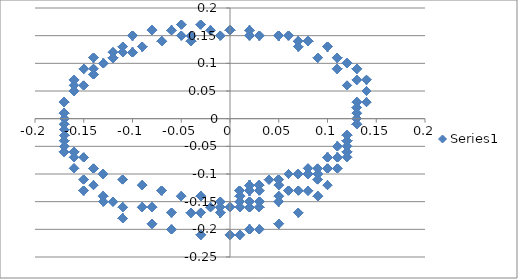
| Category | Series 0 |
|---|---|
| 0.03 | -0.15 |
| 0.03 | -0.15 |
| 0.03 | -0.15 |
| 0.03 | -0.15 |
| 0.03 | -0.15 |
| 0.03 | -0.15 |
| 0.03 | -0.15 |
| 0.03 | -0.15 |
| 0.03 | -0.15 |
| 0.03 | -0.15 |
| 0.03 | -0.15 |
| 0.03 | -0.15 |
| 0.03 | -0.15 |
| 0.03 | -0.15 |
| 0.03 | -0.15 |
| 0.03 | -0.15 |
| 0.03 | -0.15 |
| 0.03 | -0.15 |
| 0.03 | -0.15 |
| 0.03 | -0.15 |
| 0.03 | -0.15 |
| 0.03 | -0.15 |
| 0.03 | -0.15 |
| 0.03 | -0.15 |
| 0.03 | -0.15 |
| 0.03 | -0.15 |
| 0.03 | -0.15 |
| 0.03 | -0.15 |
| 0.03 | -0.15 |
| 0.03 | -0.15 |
| 0.03 | -0.15 |
| 0.03 | -0.15 |
| 0.03 | -0.15 |
| 0.03 | -0.15 |
| 0.03 | -0.15 |
| 0.03 | -0.15 |
| 0.03 | -0.15 |
| 0.03 | -0.15 |
| 0.03 | -0.15 |
| 0.03 | -0.15 |
| 0.03 | -0.15 |
| 0.03 | -0.15 |
| 0.03 | -0.15 |
| 0.03 | -0.15 |
| 0.03 | -0.15 |
| 0.03 | -0.15 |
| 0.03 | -0.15 |
| 0.03 | -0.15 |
| 0.03 | -0.15 |
| 0.03 | -0.15 |
| 0.03 | -0.15 |
| 0.03 | -0.15 |
| 0.03 | -0.15 |
| 0.03 | -0.15 |
| 0.03 | -0.15 |
| 0.03 | -0.15 |
| 0.03 | -0.15 |
| 0.03 | -0.15 |
| 0.03 | -0.15 |
| 0.03 | -0.15 |
| 0.03 | -0.15 |
| 0.03 | -0.15 |
| 0.03 | -0.15 |
| 0.03 | -0.15 |
| 0.03 | -0.15 |
| 0.03 | -0.15 |
| 0.03 | -0.15 |
| 0.03 | -0.15 |
| 0.03 | -0.15 |
| 0.03 | -0.15 |
| 0.03 | -0.15 |
| 0.03 | -0.15 |
| 0.03 | -0.15 |
| 0.03 | -0.15 |
| 0.03 | -0.15 |
| 0.03 | -0.15 |
| 0.03 | -0.15 |
| 0.03 | -0.15 |
| 0.03 | -0.15 |
| 0.03 | -0.15 |
| 0.03 | -0.15 |
| 0.03 | -0.15 |
| 0.03 | -0.15 |
| 0.03 | -0.15 |
| 0.03 | -0.15 |
| 0.03 | -0.15 |
| 0.03 | -0.15 |
| 0.03 | -0.15 |
| 0.03 | -0.15 |
| 0.03 | -0.15 |
| 0.03 | -0.15 |
| 0.03 | -0.15 |
| 0.03 | -0.15 |
| 0.03 | -0.15 |
| 0.03 | -0.15 |
| 0.03 | -0.15 |
| 0.03 | -0.15 |
| 0.03 | -0.15 |
| 0.03 | -0.15 |
| 0.03 | -0.15 |
| 0.03 | -0.15 |
| 0.03 | -0.15 |
| 0.03 | -0.15 |
| 0.03 | -0.15 |
| 0.03 | -0.15 |
| 0.03 | -0.15 |
| 0.03 | -0.15 |
| 0.03 | -0.15 |
| 0.03 | -0.15 |
| 0.03 | -0.15 |
| 0.03 | -0.15 |
| 0.03 | -0.15 |
| 0.03 | -0.15 |
| 0.03 | -0.15 |
| 0.03 | -0.15 |
| 0.03 | -0.15 |
| 0.03 | -0.15 |
| 0.03 | -0.15 |
| 0.03 | -0.15 |
| 0.03 | -0.15 |
| 0.03 | -0.15 |
| 0.03 | -0.15 |
| 0.03 | -0.15 |
| 0.03 | -0.15 |
| 0.03 | -0.15 |
| 0.03 | -0.15 |
| 0.03 | -0.15 |
| 0.03 | -0.15 |
| 0.03 | -0.15 |
| 0.03 | -0.15 |
| 0.03 | -0.15 |
| 0.03 | -0.15 |
| 0.03 | -0.15 |
| 0.03 | -0.15 |
| 0.03 | -0.15 |
| 0.03 | -0.15 |
| 0.03 | -0.15 |
| 0.03 | -0.15 |
| 0.03 | -0.15 |
| 0.03 | -0.15 |
| 0.03 | -0.15 |
| 0.03 | -0.15 |
| 0.03 | -0.15 |
| 0.03 | -0.15 |
| 0.03 | -0.15 |
| 0.03 | -0.15 |
| 0.03 | -0.15 |
| 0.03 | -0.15 |
| 0.03 | -0.15 |
| 0.03 | -0.15 |
| 0.03 | -0.15 |
| 0.03 | -0.15 |
| 0.03 | -0.15 |
| 0.03 | -0.15 |
| 0.03 | -0.15 |
| 0.03 | -0.15 |
| 0.03 | -0.15 |
| 0.03 | -0.15 |
| 0.03 | -0.15 |
| 0.03 | -0.15 |
| 0.03 | -0.15 |
| 0.03 | -0.15 |
| 0.03 | -0.15 |
| 0.03 | -0.15 |
| 0.03 | -0.15 |
| 0.03 | -0.15 |
| 0.03 | -0.15 |
| 0.03 | -0.15 |
| 0.03 | -0.15 |
| 0.03 | -0.15 |
| 0.03 | -0.15 |
| 0.03 | -0.15 |
| 0.03 | -0.15 |
| 0.03 | -0.15 |
| 0.03 | -0.15 |
| 0.03 | -0.15 |
| 0.03 | -0.15 |
| 0.03 | -0.15 |
| 0.03 | -0.15 |
| 0.03 | -0.15 |
| 0.03 | -0.15 |
| 0.03 | -0.15 |
| 0.03 | -0.15 |
| 0.03 | -0.15 |
| 0.03 | -0.15 |
| 0.03 | -0.15 |
| 0.03 | -0.15 |
| 0.03 | -0.15 |
| 0.03 | -0.15 |
| 0.03 | -0.15 |
| 0.03 | -0.15 |
| 0.03 | -0.15 |
| 0.03 | -0.15 |
| 0.03 | -0.15 |
| 0.03 | -0.15 |
| 0.03 | -0.15 |
| 0.03 | -0.15 |
| 0.03 | -0.15 |
| 0.03 | -0.15 |
| 0.03 | -0.15 |
| 0.03 | -0.15 |
| 0.03 | -0.15 |
| 0.03 | -0.15 |
| 0.03 | -0.15 |
| 0.03 | -0.15 |
| 0.03 | -0.15 |
| 0.03 | -0.15 |
| 0.03 | -0.15 |
| 0.03 | -0.15 |
| 0.03 | -0.15 |
| 0.03 | -0.15 |
| 0.03 | -0.15 |
| 0.03 | -0.15 |
| 0.03 | -0.15 |
| 0.03 | -0.15 |
| 0.03 | -0.15 |
| 0.03 | -0.16 |
| 0.03 | -0.16 |
| 0.03 | -0.16 |
| 0.03 | -0.16 |
| 0.03 | -0.16 |
| 0.03 | -0.16 |
| 0.03 | -0.15 |
| 0.03 | -0.15 |
| 0.03 | -0.15 |
| 0.03 | -0.15 |
| 0.03 | -0.15 |
| 0.03 | -0.15 |
| 0.03 | -0.15 |
| 0.03 | -0.15 |
| 0.03 | -0.15 |
| 0.03 | -0.15 |
| 0.03 | -0.15 |
| 0.03 | -0.15 |
| 0.03 | -0.16 |
| 0.03 | -0.16 |
| 0.03 | -0.16 |
| 0.03 | -0.16 |
| 0.03 | -0.16 |
| 0.03 | -0.16 |
| 0.02 | -0.2 |
| 0.02 | -0.2 |
| 0.02 | -0.2 |
| 0.02 | -0.2 |
| 0.02 | -0.2 |
| 0.02 | -0.2 |
| 0.01 | -0.21 |
| 0.01 | -0.21 |
| 0.01 | -0.21 |
| 0.01 | -0.21 |
| 0.01 | -0.21 |
| 0.01 | -0.21 |
| 0.01 | -0.21 |
| 0.01 | -0.21 |
| 0.01 | -0.21 |
| 0.01 | -0.21 |
| 0.01 | -0.21 |
| 0.01 | -0.21 |
| 0.02 | -0.2 |
| 0.02 | -0.2 |
| 0.02 | -0.2 |
| 0.02 | -0.2 |
| 0.02 | -0.2 |
| 0.02 | -0.2 |
| 0.02 | -0.15 |
| 0.02 | -0.15 |
| 0.02 | -0.15 |
| 0.02 | -0.15 |
| 0.02 | -0.15 |
| 0.02 | -0.15 |
| 0.02 | -0.15 |
| 0.02 | -0.15 |
| 0.02 | -0.15 |
| 0.02 | -0.15 |
| 0.02 | -0.15 |
| 0.02 | -0.15 |
| 0.02 | -0.15 |
| 0.02 | -0.15 |
| 0.02 | -0.15 |
| 0.02 | -0.15 |
| 0.02 | -0.15 |
| 0.02 | -0.15 |
| 0.02 | -0.15 |
| 0.02 | -0.15 |
| 0.02 | -0.15 |
| 0.02 | -0.15 |
| 0.02 | -0.15 |
| 0.02 | -0.15 |
| 0.02 | -0.16 |
| 0.02 | -0.16 |
| 0.02 | -0.16 |
| 0.02 | -0.16 |
| 0.02 | -0.16 |
| 0.02 | -0.16 |
| 0.02 | -0.16 |
| 0.02 | -0.16 |
| 0.02 | -0.16 |
| 0.02 | -0.16 |
| 0.02 | -0.16 |
| 0.02 | -0.16 |
| 0.02 | -0.16 |
| 0.02 | -0.16 |
| 0.02 | -0.16 |
| 0.02 | -0.16 |
| 0.02 | -0.16 |
| 0.02 | -0.16 |
| 0.02 | -0.16 |
| 0.02 | -0.16 |
| 0.02 | -0.16 |
| 0.02 | -0.16 |
| 0.02 | -0.16 |
| 0.02 | -0.16 |
| 0.01 | -0.16 |
| 0.01 | -0.16 |
| 0.01 | -0.16 |
| 0.01 | -0.16 |
| 0.01 | -0.16 |
| 0.01 | -0.16 |
| 0.01 | -0.16 |
| 0.01 | -0.16 |
| 0.01 | -0.16 |
| 0.01 | -0.16 |
| 0.01 | -0.16 |
| 0.01 | -0.16 |
| -0.01 | -0.17 |
| -0.01 | -0.17 |
| -0.01 | -0.17 |
| -0.01 | -0.17 |
| -0.01 | -0.17 |
| -0.01 | -0.17 |
| -0.02 | -0.16 |
| -0.02 | -0.16 |
| -0.02 | -0.16 |
| -0.02 | -0.16 |
| -0.02 | -0.16 |
| -0.02 | -0.16 |
| -0.03 | -0.17 |
| -0.03 | -0.17 |
| -0.03 | -0.17 |
| -0.03 | -0.17 |
| -0.03 | -0.17 |
| -0.03 | -0.17 |
| -0.03 | -0.17 |
| -0.03 | -0.17 |
| -0.03 | -0.17 |
| -0.03 | -0.17 |
| -0.03 | -0.17 |
| -0.03 | -0.17 |
| -0.03 | -0.17 |
| -0.03 | -0.17 |
| -0.03 | -0.17 |
| -0.03 | -0.17 |
| -0.03 | -0.17 |
| -0.03 | -0.17 |
| -0.04 | -0.17 |
| -0.04 | -0.17 |
| -0.04 | -0.17 |
| -0.04 | -0.17 |
| -0.04 | -0.17 |
| -0.04 | -0.17 |
| -0.04 | -0.17 |
| -0.04 | -0.17 |
| -0.04 | -0.17 |
| -0.04 | -0.17 |
| -0.04 | -0.17 |
| -0.04 | -0.17 |
| -0.06 | -0.17 |
| -0.06 | -0.17 |
| -0.06 | -0.17 |
| -0.06 | -0.17 |
| -0.06 | -0.17 |
| -0.06 | -0.17 |
| -0.08 | -0.16 |
| -0.08 | -0.16 |
| -0.08 | -0.16 |
| -0.08 | -0.16 |
| -0.08 | -0.16 |
| -0.08 | -0.16 |
| -0.09 | -0.16 |
| -0.09 | -0.16 |
| -0.09 | -0.16 |
| -0.09 | -0.16 |
| -0.09 | -0.16 |
| -0.09 | -0.16 |
| -0.09 | -0.16 |
| -0.09 | -0.16 |
| -0.09 | -0.16 |
| -0.09 | -0.16 |
| -0.09 | -0.16 |
| -0.09 | -0.16 |
| -0.11 | -0.16 |
| -0.11 | -0.16 |
| -0.11 | -0.16 |
| -0.11 | -0.16 |
| -0.11 | -0.16 |
| -0.11 | -0.16 |
| -0.12 | -0.15 |
| -0.12 | -0.15 |
| -0.12 | -0.15 |
| -0.12 | -0.15 |
| -0.12 | -0.15 |
| -0.12 | -0.15 |
| -0.13 | -0.14 |
| -0.13 | -0.14 |
| -0.13 | -0.14 |
| -0.13 | -0.14 |
| -0.13 | -0.14 |
| -0.13 | -0.14 |
| -0.13 | -0.14 |
| -0.13 | -0.14 |
| -0.13 | -0.14 |
| -0.13 | -0.14 |
| -0.13 | -0.14 |
| -0.13 | -0.14 |
| -0.14 | -0.12 |
| -0.14 | -0.12 |
| -0.14 | -0.12 |
| -0.14 | -0.12 |
| -0.14 | -0.12 |
| -0.14 | -0.12 |
| -0.15 | -0.11 |
| -0.15 | -0.11 |
| -0.15 | -0.11 |
| -0.15 | -0.11 |
| -0.15 | -0.11 |
| -0.15 | -0.11 |
| -0.16 | -0.09 |
| -0.16 | -0.09 |
| -0.16 | -0.09 |
| -0.16 | -0.09 |
| -0.16 | -0.09 |
| -0.16 | -0.09 |
| -0.16 | -0.09 |
| -0.16 | -0.09 |
| -0.16 | -0.09 |
| -0.16 | -0.09 |
| -0.16 | -0.09 |
| -0.16 | -0.09 |
| -0.16 | -0.07 |
| -0.16 | -0.07 |
| -0.16 | -0.07 |
| -0.16 | -0.07 |
| -0.16 | -0.07 |
| -0.16 | -0.07 |
| -0.17 | -0.06 |
| -0.17 | -0.06 |
| -0.17 | -0.06 |
| -0.17 | -0.06 |
| -0.17 | -0.06 |
| -0.17 | -0.06 |
| -0.17 | -0.06 |
| -0.17 | -0.06 |
| -0.17 | -0.06 |
| -0.17 | -0.06 |
| -0.17 | -0.06 |
| -0.17 | -0.06 |
| -0.17 | -0.05 |
| -0.17 | -0.05 |
| -0.17 | -0.05 |
| -0.17 | -0.05 |
| -0.17 | -0.05 |
| -0.17 | -0.05 |
| -0.17 | -0.04 |
| -0.17 | -0.04 |
| -0.17 | -0.04 |
| -0.17 | -0.04 |
| -0.17 | -0.04 |
| -0.17 | -0.04 |
| -0.17 | -0.03 |
| -0.17 | -0.03 |
| -0.17 | -0.03 |
| -0.17 | -0.03 |
| -0.17 | -0.03 |
| -0.17 | -0.03 |
| -0.17 | -0.03 |
| -0.17 | -0.03 |
| -0.17 | -0.03 |
| -0.17 | -0.03 |
| -0.17 | -0.03 |
| -0.17 | -0.03 |
| -0.17 | -0.02 |
| -0.17 | -0.02 |
| -0.17 | -0.02 |
| -0.17 | -0.02 |
| -0.17 | -0.02 |
| -0.17 | -0.02 |
| -0.17 | 0 |
| -0.17 | 0 |
| -0.17 | 0 |
| -0.17 | 0 |
| -0.17 | 0 |
| -0.17 | 0 |
| -0.17 | 0.01 |
| -0.17 | 0.01 |
| -0.17 | 0.01 |
| -0.17 | 0.01 |
| -0.17 | 0.01 |
| -0.17 | 0.01 |
| -0.17 | 0.01 |
| -0.17 | 0.01 |
| -0.17 | 0.01 |
| -0.17 | 0.01 |
| -0.17 | 0.01 |
| -0.17 | 0.01 |
| -0.17 | 0.03 |
| -0.17 | 0.03 |
| -0.17 | 0.03 |
| -0.17 | 0.03 |
| -0.17 | 0.03 |
| -0.17 | 0.03 |
| -0.16 | 0.05 |
| -0.16 | 0.05 |
| -0.16 | 0.05 |
| -0.16 | 0.05 |
| -0.16 | 0.05 |
| -0.16 | 0.05 |
| -0.16 | 0.05 |
| -0.16 | 0.05 |
| -0.16 | 0.05 |
| -0.16 | 0.05 |
| -0.16 | 0.05 |
| -0.16 | 0.05 |
| -0.15 | 0.06 |
| -0.15 | 0.06 |
| -0.15 | 0.06 |
| -0.15 | 0.06 |
| -0.15 | 0.06 |
| -0.15 | 0.06 |
| -0.14 | 0.08 |
| -0.14 | 0.08 |
| -0.14 | 0.08 |
| -0.14 | 0.08 |
| -0.14 | 0.08 |
| -0.14 | 0.08 |
| -0.13 | 0.1 |
| -0.13 | 0.1 |
| -0.13 | 0.1 |
| -0.13 | 0.1 |
| -0.13 | 0.1 |
| -0.13 | 0.1 |
| -0.13 | 0.1 |
| -0.13 | 0.1 |
| -0.13 | 0.1 |
| -0.13 | 0.1 |
| -0.13 | 0.1 |
| -0.13 | 0.1 |
| -0.12 | 0.11 |
| -0.12 | 0.11 |
| -0.12 | 0.11 |
| -0.12 | 0.11 |
| -0.12 | 0.11 |
| -0.12 | 0.11 |
| -0.11 | 0.12 |
| -0.11 | 0.12 |
| -0.11 | 0.12 |
| -0.11 | 0.12 |
| -0.11 | 0.12 |
| -0.11 | 0.12 |
| -0.09 | 0.13 |
| -0.09 | 0.13 |
| -0.09 | 0.13 |
| -0.09 | 0.13 |
| -0.09 | 0.13 |
| -0.09 | 0.13 |
| -0.09 | 0.13 |
| -0.09 | 0.13 |
| -0.09 | 0.13 |
| -0.09 | 0.13 |
| -0.09 | 0.13 |
| -0.09 | 0.13 |
| -0.07 | 0.14 |
| -0.07 | 0.14 |
| -0.07 | 0.14 |
| -0.07 | 0.14 |
| -0.07 | 0.14 |
| -0.07 | 0.14 |
| -0.05 | 0.15 |
| -0.05 | 0.15 |
| -0.05 | 0.15 |
| -0.05 | 0.15 |
| -0.05 | 0.15 |
| -0.05 | 0.15 |
| -0.04 | 0.15 |
| -0.04 | 0.15 |
| -0.04 | 0.15 |
| -0.04 | 0.15 |
| -0.04 | 0.15 |
| -0.04 | 0.15 |
| -0.04 | 0.15 |
| -0.04 | 0.15 |
| -0.04 | 0.15 |
| -0.04 | 0.15 |
| -0.04 | 0.15 |
| -0.04 | 0.15 |
| -0.02 | 0.16 |
| -0.02 | 0.16 |
| -0.02 | 0.16 |
| -0.02 | 0.16 |
| -0.02 | 0.16 |
| -0.02 | 0.16 |
| 0.0 | 0.16 |
| 0.0 | 0.16 |
| 0.0 | 0.16 |
| 0.0 | 0.16 |
| 0.0 | 0.16 |
| 0.0 | 0.16 |
| 0.0 | 0.16 |
| 0.0 | 0.16 |
| 0.0 | 0.16 |
| 0.0 | 0.16 |
| 0.0 | 0.16 |
| 0.0 | 0.16 |
| 0.02 | 0.16 |
| 0.02 | 0.16 |
| 0.02 | 0.16 |
| 0.02 | 0.16 |
| 0.02 | 0.16 |
| 0.02 | 0.16 |
| 0.03 | 0.15 |
| 0.03 | 0.15 |
| 0.03 | 0.15 |
| 0.03 | 0.15 |
| 0.03 | 0.15 |
| 0.03 | 0.15 |
| 0.05 | 0.15 |
| 0.05 | 0.15 |
| 0.05 | 0.15 |
| 0.05 | 0.15 |
| 0.05 | 0.15 |
| 0.05 | 0.15 |
| 0.05 | 0.15 |
| 0.05 | 0.15 |
| 0.05 | 0.15 |
| 0.05 | 0.15 |
| 0.05 | 0.15 |
| 0.05 | 0.15 |
| 0.06 | 0.15 |
| 0.06 | 0.15 |
| 0.06 | 0.15 |
| 0.06 | 0.15 |
| 0.06 | 0.15 |
| 0.06 | 0.15 |
| 0.07 | 0.14 |
| 0.07 | 0.14 |
| 0.07 | 0.14 |
| 0.07 | 0.14 |
| 0.07 | 0.14 |
| 0.07 | 0.14 |
| 0.08 | 0.14 |
| 0.08 | 0.14 |
| 0.08 | 0.14 |
| 0.08 | 0.14 |
| 0.08 | 0.14 |
| 0.08 | 0.14 |
| 0.08 | 0.14 |
| 0.08 | 0.14 |
| 0.08 | 0.14 |
| 0.08 | 0.14 |
| 0.08 | 0.14 |
| 0.08 | 0.14 |
| 0.1 | 0.13 |
| 0.1 | 0.13 |
| 0.1 | 0.13 |
| 0.1 | 0.13 |
| 0.1 | 0.13 |
| 0.1 | 0.13 |
| 0.11 | 0.11 |
| 0.11 | 0.11 |
| 0.11 | 0.11 |
| 0.11 | 0.11 |
| 0.11 | 0.11 |
| 0.11 | 0.11 |
| 0.11 | 0.11 |
| 0.11 | 0.11 |
| 0.11 | 0.11 |
| 0.11 | 0.11 |
| 0.11 | 0.11 |
| 0.11 | 0.11 |
| 0.12 | 0.1 |
| 0.12 | 0.1 |
| 0.12 | 0.1 |
| 0.12 | 0.1 |
| 0.12 | 0.1 |
| 0.12 | 0.1 |
| 0.13 | 0.09 |
| 0.13 | 0.09 |
| 0.13 | 0.09 |
| 0.13 | 0.09 |
| 0.13 | 0.09 |
| 0.13 | 0.09 |
| 0.14 | 0.07 |
| 0.14 | 0.07 |
| 0.14 | 0.07 |
| 0.14 | 0.07 |
| 0.14 | 0.07 |
| 0.14 | 0.07 |
| 0.14 | 0.07 |
| 0.14 | 0.07 |
| 0.14 | 0.07 |
| 0.14 | 0.07 |
| 0.14 | 0.07 |
| 0.14 | 0.07 |
| 0.14 | 0.05 |
| 0.14 | 0.05 |
| 0.14 | 0.05 |
| 0.14 | 0.05 |
| 0.14 | 0.05 |
| 0.14 | 0.05 |
| 0.13 | 0.02 |
| 0.13 | 0.02 |
| 0.13 | 0.02 |
| 0.13 | 0.02 |
| 0.13 | 0.02 |
| 0.13 | 0.02 |
| 0.13 | 0 |
| 0.13 | 0 |
| 0.13 | 0 |
| 0.13 | 0 |
| 0.13 | 0 |
| 0.13 | 0 |
| 0.13 | 0 |
| 0.13 | 0 |
| 0.13 | 0 |
| 0.13 | 0 |
| 0.13 | 0 |
| 0.13 | 0 |
| 0.12 | -0.03 |
| 0.12 | -0.03 |
| 0.12 | -0.03 |
| 0.12 | -0.03 |
| 0.12 | -0.03 |
| 0.12 | -0.03 |
| 0.11 | -0.05 |
| 0.11 | -0.05 |
| 0.11 | -0.05 |
| 0.11 | -0.05 |
| 0.11 | -0.05 |
| 0.11 | -0.05 |
| 0.1 | -0.07 |
| 0.1 | -0.07 |
| 0.1 | -0.07 |
| 0.1 | -0.07 |
| 0.1 | -0.07 |
| 0.1 | -0.07 |
| 0.1 | -0.07 |
| 0.1 | -0.07 |
| 0.1 | -0.07 |
| 0.1 | -0.07 |
| 0.1 | -0.07 |
| 0.1 | -0.07 |
| 0.09 | -0.09 |
| 0.09 | -0.09 |
| 0.09 | -0.09 |
| 0.09 | -0.09 |
| 0.09 | -0.09 |
| 0.09 | -0.09 |
| 0.07 | -0.1 |
| 0.07 | -0.1 |
| 0.07 | -0.1 |
| 0.07 | -0.1 |
| 0.07 | -0.1 |
| 0.07 | -0.1 |
| 0.07 | -0.1 |
| 0.07 | -0.1 |
| 0.07 | -0.1 |
| 0.07 | -0.1 |
| 0.07 | -0.1 |
| 0.07 | -0.1 |
| 0.05 | -0.12 |
| 0.05 | -0.12 |
| 0.05 | -0.12 |
| 0.05 | -0.12 |
| 0.05 | -0.12 |
| 0.05 | -0.12 |
| 0.03 | -0.13 |
| 0.03 | -0.13 |
| 0.03 | -0.13 |
| 0.03 | -0.13 |
| 0.03 | -0.13 |
| 0.03 | -0.13 |
| 0.02 | -0.15 |
| 0.02 | -0.15 |
| 0.02 | -0.15 |
| 0.02 | -0.15 |
| 0.02 | -0.15 |
| 0.02 | -0.15 |
| 0.02 | -0.15 |
| 0.02 | -0.15 |
| 0.02 | -0.15 |
| 0.02 | -0.15 |
| 0.02 | -0.15 |
| 0.02 | -0.15 |
| 0.01 | -0.16 |
| 0.01 | -0.16 |
| 0.01 | -0.16 |
| 0.01 | -0.16 |
| 0.01 | -0.16 |
| 0.01 | -0.16 |
| 0.01 | -0.14 |
| 0.01 | -0.14 |
| 0.01 | -0.14 |
| 0.01 | -0.14 |
| 0.01 | -0.14 |
| 0.01 | -0.14 |
| 0.01 | -0.14 |
| 0.01 | -0.14 |
| 0.01 | -0.14 |
| 0.01 | -0.14 |
| 0.01 | -0.14 |
| 0.01 | -0.14 |
| 0.01 | -0.14 |
| 0.01 | -0.14 |
| 0.01 | -0.14 |
| 0.01 | -0.14 |
| 0.01 | -0.14 |
| 0.01 | -0.14 |
| 0.02 | -0.13 |
| 0.02 | -0.13 |
| 0.02 | -0.13 |
| 0.02 | -0.13 |
| 0.02 | -0.13 |
| 0.02 | -0.13 |
| 0.03 | -0.12 |
| 0.03 | -0.12 |
| 0.03 | -0.12 |
| 0.03 | -0.12 |
| 0.03 | -0.12 |
| 0.03 | -0.12 |
| 0.03 | -0.12 |
| 0.03 | -0.12 |
| 0.03 | -0.12 |
| 0.03 | -0.12 |
| 0.03 | -0.12 |
| 0.03 | -0.12 |
| 0.05 | -0.11 |
| 0.05 | -0.11 |
| 0.05 | -0.11 |
| 0.05 | -0.11 |
| 0.05 | -0.11 |
| 0.05 | -0.11 |
| 0.06 | -0.1 |
| 0.06 | -0.1 |
| 0.06 | -0.1 |
| 0.06 | -0.1 |
| 0.06 | -0.1 |
| 0.06 | -0.1 |
| 0.08 | -0.09 |
| 0.08 | -0.09 |
| 0.08 | -0.09 |
| 0.08 | -0.09 |
| 0.08 | -0.09 |
| 0.08 | -0.09 |
| 0.08 | -0.09 |
| 0.08 | -0.09 |
| 0.08 | -0.09 |
| 0.08 | -0.09 |
| 0.08 | -0.09 |
| 0.08 | -0.09 |
| 0.1 | -0.07 |
| 0.1 | -0.07 |
| 0.1 | -0.07 |
| 0.1 | -0.07 |
| 0.1 | -0.07 |
| 0.1 | -0.07 |
| 0.11 | -0.05 |
| 0.11 | -0.05 |
| 0.11 | -0.05 |
| 0.11 | -0.05 |
| 0.11 | -0.05 |
| 0.11 | -0.05 |
| 0.12 | -0.04 |
| 0.12 | -0.04 |
| 0.12 | -0.04 |
| 0.12 | -0.04 |
| 0.12 | -0.04 |
| 0.12 | -0.04 |
| 0.12 | -0.04 |
| 0.12 | -0.04 |
| 0.12 | -0.04 |
| 0.12 | -0.04 |
| 0.12 | -0.04 |
| 0.12 | -0.04 |
| 0.12 | -0.03 |
| 0.12 | -0.03 |
| 0.12 | -0.03 |
| 0.12 | -0.03 |
| 0.12 | -0.03 |
| 0.12 | -0.03 |
| 0.13 | -0.01 |
| 0.13 | -0.01 |
| 0.13 | -0.01 |
| 0.13 | -0.01 |
| 0.13 | -0.01 |
| 0.13 | -0.01 |
| 0.13 | -0.01 |
| 0.13 | -0.01 |
| 0.13 | -0.01 |
| 0.13 | -0.01 |
| 0.13 | -0.01 |
| 0.13 | -0.01 |
| 0.13 | 0.01 |
| 0.13 | 0.01 |
| 0.13 | 0.01 |
| 0.13 | 0.01 |
| 0.13 | 0.01 |
| 0.13 | 0.01 |
| 0.14 | 0.03 |
| 0.14 | 0.03 |
| 0.14 | 0.03 |
| 0.14 | 0.03 |
| 0.14 | 0.03 |
| 0.14 | 0.03 |
| 0.14 | 0.05 |
| 0.14 | 0.05 |
| 0.14 | 0.05 |
| 0.14 | 0.05 |
| 0.14 | 0.05 |
| 0.14 | 0.05 |
| 0.14 | 0.05 |
| 0.14 | 0.05 |
| 0.14 | 0.05 |
| 0.14 | 0.05 |
| 0.14 | 0.05 |
| 0.14 | 0.05 |
| 0.13 | 0.07 |
| 0.13 | 0.07 |
| 0.13 | 0.07 |
| 0.13 | 0.07 |
| 0.13 | 0.07 |
| 0.13 | 0.07 |
| 0.13 | 0.09 |
| 0.13 | 0.09 |
| 0.13 | 0.09 |
| 0.13 | 0.09 |
| 0.13 | 0.09 |
| 0.13 | 0.09 |
| 0.12 | 0.1 |
| 0.12 | 0.1 |
| 0.12 | 0.1 |
| 0.12 | 0.1 |
| 0.12 | 0.1 |
| 0.12 | 0.1 |
| 0.12 | 0.1 |
| 0.12 | 0.1 |
| 0.12 | 0.1 |
| 0.12 | 0.1 |
| 0.12 | 0.1 |
| 0.12 | 0.1 |
| 0.11 | 0.11 |
| 0.11 | 0.11 |
| 0.11 | 0.11 |
| 0.11 | 0.11 |
| 0.11 | 0.11 |
| 0.11 | 0.11 |
| 0.1 | 0.13 |
| 0.1 | 0.13 |
| 0.1 | 0.13 |
| 0.1 | 0.13 |
| 0.1 | 0.13 |
| 0.1 | 0.13 |
| 0.08 | 0.14 |
| 0.08 | 0.14 |
| 0.08 | 0.14 |
| 0.08 | 0.14 |
| 0.08 | 0.14 |
| 0.08 | 0.14 |
| 0.08 | 0.14 |
| 0.08 | 0.14 |
| 0.08 | 0.14 |
| 0.08 | 0.14 |
| 0.08 | 0.14 |
| 0.08 | 0.14 |
| 0.07 | 0.14 |
| 0.07 | 0.14 |
| 0.07 | 0.14 |
| 0.07 | 0.14 |
| 0.07 | 0.14 |
| 0.07 | 0.14 |
| 0.05 | 0.15 |
| 0.05 | 0.15 |
| 0.05 | 0.15 |
| 0.05 | 0.15 |
| 0.05 | 0.15 |
| 0.05 | 0.15 |
| 0.05 | 0.15 |
| 0.05 | 0.15 |
| 0.05 | 0.15 |
| 0.05 | 0.15 |
| 0.05 | 0.15 |
| 0.05 | 0.15 |
| 0.03 | 0.15 |
| 0.03 | 0.15 |
| 0.03 | 0.15 |
| 0.03 | 0.15 |
| 0.03 | 0.15 |
| 0.03 | 0.15 |
| 0.02 | 0.16 |
| 0.02 | 0.16 |
| 0.02 | 0.16 |
| 0.02 | 0.16 |
| 0.02 | 0.16 |
| 0.02 | 0.16 |
| 0.0 | 0.16 |
| 0.0 | 0.16 |
| 0.0 | 0.16 |
| 0.0 | 0.16 |
| 0.0 | 0.16 |
| 0.0 | 0.16 |
| 0.0 | 0.16 |
| 0.0 | 0.16 |
| 0.0 | 0.16 |
| 0.0 | 0.16 |
| 0.0 | 0.16 |
| 0.0 | 0.16 |
| -0.03 | 0.17 |
| -0.03 | 0.17 |
| -0.03 | 0.17 |
| -0.03 | 0.17 |
| -0.03 | 0.17 |
| -0.03 | 0.17 |
| -0.05 | 0.17 |
| -0.05 | 0.17 |
| -0.05 | 0.17 |
| -0.05 | 0.17 |
| -0.05 | 0.17 |
| -0.05 | 0.17 |
| -0.06 | 0.16 |
| -0.06 | 0.16 |
| -0.06 | 0.16 |
| -0.06 | 0.16 |
| -0.06 | 0.16 |
| -0.06 | 0.16 |
| -0.06 | 0.16 |
| -0.06 | 0.16 |
| -0.06 | 0.16 |
| -0.06 | 0.16 |
| -0.06 | 0.16 |
| -0.06 | 0.16 |
| -0.08 | 0.16 |
| -0.08 | 0.16 |
| -0.08 | 0.16 |
| -0.08 | 0.16 |
| -0.08 | 0.16 |
| -0.08 | 0.16 |
| -0.1 | 0.15 |
| -0.1 | 0.15 |
| -0.1 | 0.15 |
| -0.1 | 0.15 |
| -0.1 | 0.15 |
| -0.1 | 0.15 |
| -0.1 | 0.15 |
| -0.1 | 0.15 |
| -0.1 | 0.15 |
| -0.1 | 0.15 |
| -0.1 | 0.15 |
| -0.1 | 0.15 |
| -0.11 | 0.13 |
| -0.11 | 0.13 |
| -0.11 | 0.13 |
| -0.11 | 0.13 |
| -0.11 | 0.13 |
| -0.11 | 0.13 |
| -0.12 | 0.12 |
| -0.12 | 0.12 |
| -0.12 | 0.12 |
| -0.12 | 0.12 |
| -0.12 | 0.12 |
| -0.12 | 0.12 |
| -0.14 | 0.11 |
| -0.14 | 0.11 |
| -0.14 | 0.11 |
| -0.14 | 0.11 |
| -0.14 | 0.11 |
| -0.14 | 0.11 |
| -0.14 | 0.11 |
| -0.14 | 0.11 |
| -0.14 | 0.11 |
| -0.14 | 0.11 |
| -0.14 | 0.11 |
| -0.14 | 0.11 |
| -0.15 | 0.09 |
| -0.15 | 0.09 |
| -0.15 | 0.09 |
| -0.15 | 0.09 |
| -0.15 | 0.09 |
| -0.15 | 0.09 |
| -0.16 | 0.07 |
| -0.16 | 0.07 |
| -0.16 | 0.07 |
| -0.16 | 0.07 |
| -0.16 | 0.07 |
| -0.16 | 0.07 |
| -0.16 | 0.05 |
| -0.16 | 0.05 |
| -0.16 | 0.05 |
| -0.16 | 0.05 |
| -0.16 | 0.05 |
| -0.16 | 0.05 |
| -0.16 | 0.05 |
| -0.16 | 0.05 |
| -0.16 | 0.05 |
| -0.16 | 0.05 |
| -0.16 | 0.05 |
| -0.16 | 0.05 |
| -0.17 | 0.03 |
| -0.17 | 0.03 |
| -0.17 | 0.03 |
| -0.17 | 0.03 |
| -0.17 | 0.03 |
| -0.17 | 0.03 |
| -0.17 | 0.01 |
| -0.17 | 0.01 |
| -0.17 | 0.01 |
| -0.17 | 0.01 |
| -0.17 | 0.01 |
| -0.17 | 0.01 |
| -0.17 | -0.01 |
| -0.17 | -0.01 |
| -0.17 | -0.01 |
| -0.17 | -0.01 |
| -0.17 | -0.01 |
| -0.17 | -0.01 |
| -0.17 | -0.01 |
| -0.17 | -0.01 |
| -0.17 | -0.01 |
| -0.17 | -0.01 |
| -0.17 | -0.01 |
| -0.17 | -0.01 |
| -0.17 | -0.04 |
| -0.17 | -0.04 |
| -0.17 | -0.04 |
| -0.17 | -0.04 |
| -0.17 | -0.04 |
| -0.17 | -0.04 |
| -0.16 | -0.06 |
| -0.16 | -0.06 |
| -0.16 | -0.06 |
| -0.16 | -0.06 |
| -0.16 | -0.06 |
| -0.16 | -0.06 |
| -0.16 | -0.06 |
| -0.16 | -0.06 |
| -0.16 | -0.06 |
| -0.16 | -0.06 |
| -0.16 | -0.06 |
| -0.16 | -0.06 |
| -0.15 | -0.07 |
| -0.15 | -0.07 |
| -0.15 | -0.07 |
| -0.15 | -0.07 |
| -0.15 | -0.07 |
| -0.15 | -0.07 |
| -0.14 | -0.09 |
| -0.14 | -0.09 |
| -0.14 | -0.09 |
| -0.14 | -0.09 |
| -0.14 | -0.09 |
| -0.14 | -0.09 |
| -0.13 | -0.1 |
| -0.13 | -0.1 |
| -0.13 | -0.1 |
| -0.13 | -0.1 |
| -0.13 | -0.1 |
| -0.13 | -0.1 |
| -0.13 | -0.1 |
| -0.13 | -0.1 |
| -0.13 | -0.1 |
| -0.13 | -0.1 |
| -0.13 | -0.1 |
| -0.13 | -0.1 |
| -0.11 | -0.11 |
| -0.11 | -0.11 |
| -0.11 | -0.11 |
| -0.11 | -0.11 |
| -0.11 | -0.11 |
| -0.11 | -0.11 |
| -0.09 | -0.12 |
| -0.09 | -0.12 |
| -0.09 | -0.12 |
| -0.09 | -0.12 |
| -0.09 | -0.12 |
| -0.09 | -0.12 |
| -0.07 | -0.13 |
| -0.07 | -0.13 |
| -0.07 | -0.13 |
| -0.07 | -0.13 |
| -0.07 | -0.13 |
| -0.07 | -0.13 |
| -0.07 | -0.13 |
| -0.07 | -0.13 |
| -0.07 | -0.13 |
| -0.07 | -0.13 |
| -0.07 | -0.13 |
| -0.07 | -0.13 |
| -0.05 | -0.14 |
| -0.05 | -0.14 |
| -0.05 | -0.14 |
| -0.05 | -0.14 |
| -0.05 | -0.14 |
| -0.05 | -0.14 |
| -0.03 | -0.14 |
| -0.03 | -0.14 |
| -0.03 | -0.14 |
| -0.03 | -0.14 |
| -0.03 | -0.14 |
| -0.03 | -0.14 |
| -0.03 | -0.14 |
| -0.03 | -0.14 |
| -0.03 | -0.14 |
| -0.03 | -0.14 |
| -0.03 | -0.14 |
| -0.03 | -0.14 |
| -0.01 | -0.15 |
| -0.01 | -0.15 |
| -0.01 | -0.15 |
| -0.01 | -0.15 |
| -0.01 | -0.15 |
| -0.01 | -0.15 |
| 0.01 | -0.15 |
| 0.01 | -0.15 |
| 0.01 | -0.15 |
| 0.01 | -0.15 |
| 0.01 | -0.15 |
| 0.01 | -0.15 |
| 0.03 | -0.15 |
| 0.03 | -0.15 |
| 0.03 | -0.15 |
| 0.03 | -0.15 |
| 0.03 | -0.15 |
| 0.03 | -0.15 |
| 0.03 | -0.15 |
| 0.03 | -0.15 |
| 0.03 | -0.15 |
| 0.03 | -0.15 |
| 0.03 | -0.15 |
| 0.03 | -0.15 |
| 0.05 | -0.14 |
| 0.05 | -0.14 |
| 0.05 | -0.14 |
| 0.05 | -0.14 |
| 0.05 | -0.14 |
| 0.05 | -0.14 |
| 0.06 | -0.13 |
| 0.06 | -0.13 |
| 0.06 | -0.13 |
| 0.06 | -0.13 |
| 0.06 | -0.13 |
| 0.06 | -0.13 |
| 0.08 | -0.13 |
| 0.08 | -0.13 |
| 0.08 | -0.13 |
| 0.08 | -0.13 |
| 0.08 | -0.13 |
| 0.08 | -0.13 |
| 0.08 | -0.13 |
| 0.08 | -0.13 |
| 0.08 | -0.13 |
| 0.08 | -0.13 |
| 0.08 | -0.13 |
| 0.08 | -0.13 |
| 0.09 | -0.11 |
| 0.09 | -0.11 |
| 0.09 | -0.11 |
| 0.09 | -0.11 |
| 0.09 | -0.11 |
| 0.09 | -0.11 |
| 0.09 | -0.1 |
| 0.09 | -0.1 |
| 0.09 | -0.1 |
| 0.09 | -0.1 |
| 0.09 | -0.1 |
| 0.09 | -0.1 |
| 0.1 | -0.09 |
| 0.1 | -0.09 |
| 0.1 | -0.09 |
| 0.1 | -0.09 |
| 0.1 | -0.09 |
| 0.1 | -0.09 |
| 0.1 | -0.09 |
| 0.1 | -0.09 |
| 0.1 | -0.09 |
| 0.1 | -0.09 |
| 0.1 | -0.09 |
| 0.1 | -0.09 |
| 0.11 | -0.07 |
| 0.11 | -0.07 |
| 0.11 | -0.07 |
| 0.11 | -0.07 |
| 0.11 | -0.07 |
| 0.11 | -0.07 |
| 0.12 | -0.06 |
| 0.12 | -0.06 |
| 0.12 | -0.06 |
| 0.12 | -0.06 |
| 0.12 | -0.06 |
| 0.12 | -0.06 |
| 0.12 | -0.06 |
| 0.12 | -0.06 |
| 0.12 | -0.06 |
| 0.12 | -0.06 |
| 0.12 | -0.06 |
| 0.12 | -0.06 |
| 0.12 | -0.04 |
| 0.12 | -0.04 |
| 0.12 | -0.04 |
| 0.12 | -0.04 |
| 0.12 | -0.04 |
| 0.12 | -0.04 |
| 0.12 | -0.05 |
| 0.12 | -0.05 |
| 0.12 | -0.05 |
| 0.12 | -0.05 |
| 0.12 | -0.05 |
| 0.12 | -0.05 |
| 0.12 | -0.07 |
| 0.12 | -0.07 |
| 0.12 | -0.07 |
| 0.12 | -0.07 |
| 0.12 | -0.07 |
| 0.12 | -0.07 |
| 0.12 | -0.07 |
| 0.12 | -0.07 |
| 0.12 | -0.07 |
| 0.12 | -0.07 |
| 0.12 | -0.07 |
| 0.12 | -0.07 |
| 0.11 | -0.09 |
| 0.11 | -0.09 |
| 0.11 | -0.09 |
| 0.11 | -0.09 |
| 0.11 | -0.09 |
| 0.11 | -0.09 |
| 0.1 | -0.12 |
| 0.1 | -0.12 |
| 0.1 | -0.12 |
| 0.1 | -0.12 |
| 0.1 | -0.12 |
| 0.1 | -0.12 |
| 0.09 | -0.14 |
| 0.09 | -0.14 |
| 0.09 | -0.14 |
| 0.09 | -0.14 |
| 0.09 | -0.14 |
| 0.09 | -0.14 |
| 0.09 | -0.14 |
| 0.09 | -0.14 |
| 0.09 | -0.14 |
| 0.09 | -0.14 |
| 0.09 | -0.14 |
| 0.09 | -0.14 |
| 0.07 | -0.17 |
| 0.07 | -0.17 |
| 0.07 | -0.17 |
| 0.07 | -0.17 |
| 0.07 | -0.17 |
| 0.07 | -0.17 |
| 0.05 | -0.19 |
| 0.05 | -0.19 |
| 0.05 | -0.19 |
| 0.05 | -0.19 |
| 0.05 | -0.19 |
| 0.05 | -0.19 |
| 0.05 | -0.19 |
| 0.05 | -0.19 |
| 0.05 | -0.19 |
| 0.05 | -0.19 |
| 0.05 | -0.19 |
| 0.05 | -0.19 |
| 0.03 | -0.2 |
| 0.03 | -0.2 |
| 0.03 | -0.2 |
| 0.03 | -0.2 |
| 0.03 | -0.2 |
| 0.03 | -0.2 |
| 0.0 | -0.21 |
| 0.0 | -0.21 |
| 0.0 | -0.21 |
| 0.0 | -0.21 |
| 0.0 | -0.21 |
| 0.0 | -0.21 |
| -0.03 | -0.21 |
| -0.03 | -0.21 |
| -0.03 | -0.21 |
| -0.03 | -0.21 |
| -0.03 | -0.21 |
| -0.03 | -0.21 |
| -0.03 | -0.21 |
| -0.03 | -0.21 |
| -0.03 | -0.21 |
| -0.03 | -0.21 |
| -0.03 | -0.21 |
| -0.03 | -0.21 |
| -0.06 | -0.2 |
| -0.06 | -0.2 |
| -0.06 | -0.2 |
| -0.06 | -0.2 |
| -0.06 | -0.2 |
| -0.06 | -0.2 |
| -0.08 | -0.19 |
| -0.08 | -0.19 |
| -0.08 | -0.19 |
| -0.08 | -0.19 |
| -0.08 | -0.19 |
| -0.08 | -0.19 |
| -0.11 | -0.18 |
| -0.11 | -0.18 |
| -0.11 | -0.18 |
| -0.11 | -0.18 |
| -0.11 | -0.18 |
| -0.11 | -0.18 |
| -0.11 | -0.18 |
| -0.11 | -0.18 |
| -0.11 | -0.18 |
| -0.11 | -0.18 |
| -0.11 | -0.18 |
| -0.11 | -0.18 |
| -0.13 | -0.15 |
| -0.13 | -0.15 |
| -0.13 | -0.15 |
| -0.13 | -0.15 |
| -0.13 | -0.15 |
| -0.13 | -0.15 |
| -0.15 | -0.13 |
| -0.15 | -0.13 |
| -0.15 | -0.13 |
| -0.15 | -0.13 |
| -0.15 | -0.13 |
| -0.15 | -0.13 |
| -0.15 | -0.13 |
| -0.15 | -0.13 |
| -0.15 | -0.13 |
| -0.15 | -0.13 |
| -0.15 | -0.13 |
| -0.15 | -0.13 |
| -0.16 | -0.09 |
| -0.16 | -0.09 |
| -0.16 | -0.09 |
| -0.16 | -0.09 |
| -0.16 | -0.09 |
| -0.16 | -0.09 |
| -0.17 | -0.06 |
| -0.17 | -0.06 |
| -0.17 | -0.06 |
| -0.17 | -0.06 |
| -0.17 | -0.06 |
| -0.17 | -0.06 |
| -0.17 | -0.03 |
| -0.17 | -0.03 |
| -0.17 | -0.03 |
| -0.17 | -0.03 |
| -0.17 | -0.03 |
| -0.17 | -0.03 |
| -0.17 | -0.03 |
| -0.17 | -0.03 |
| -0.17 | -0.03 |
| -0.17 | -0.03 |
| -0.17 | -0.03 |
| -0.17 | -0.03 |
| -0.17 | 0 |
| -0.17 | 0 |
| -0.17 | 0 |
| -0.17 | 0 |
| -0.17 | 0 |
| -0.17 | 0 |
| -0.17 | 0.03 |
| -0.17 | 0.03 |
| -0.17 | 0.03 |
| -0.17 | 0.03 |
| -0.17 | 0.03 |
| -0.17 | 0.03 |
| -0.16 | 0.06 |
| -0.16 | 0.06 |
| -0.16 | 0.06 |
| -0.16 | 0.06 |
| -0.16 | 0.06 |
| -0.16 | 0.06 |
| -0.16 | 0.06 |
| -0.16 | 0.06 |
| -0.16 | 0.06 |
| -0.16 | 0.06 |
| -0.16 | 0.06 |
| -0.16 | 0.06 |
| -0.14 | 0.09 |
| -0.14 | 0.09 |
| -0.14 | 0.09 |
| -0.14 | 0.09 |
| -0.14 | 0.09 |
| -0.14 | 0.09 |
| -0.12 | 0.11 |
| -0.12 | 0.11 |
| -0.12 | 0.11 |
| -0.12 | 0.11 |
| -0.12 | 0.11 |
| -0.12 | 0.11 |
| -0.1 | 0.12 |
| -0.1 | 0.12 |
| -0.1 | 0.12 |
| -0.1 | 0.12 |
| -0.1 | 0.12 |
| -0.1 | 0.12 |
| -0.1 | 0.12 |
| -0.1 | 0.12 |
| -0.1 | 0.12 |
| -0.1 | 0.12 |
| -0.1 | 0.12 |
| -0.1 | 0.12 |
| -0.07 | 0.14 |
| -0.07 | 0.14 |
| -0.07 | 0.14 |
| -0.07 | 0.14 |
| -0.07 | 0.14 |
| -0.07 | 0.14 |
| -0.04 | 0.14 |
| -0.04 | 0.14 |
| -0.04 | 0.14 |
| -0.04 | 0.14 |
| -0.04 | 0.14 |
| -0.04 | 0.14 |
| -0.04 | 0.14 |
| -0.04 | 0.14 |
| -0.04 | 0.14 |
| -0.04 | 0.14 |
| -0.04 | 0.14 |
| -0.04 | 0.14 |
| -0.01 | 0.15 |
| -0.01 | 0.15 |
| -0.01 | 0.15 |
| -0.01 | 0.15 |
| -0.01 | 0.15 |
| -0.01 | 0.15 |
| 0.02 | 0.15 |
| 0.02 | 0.15 |
| 0.02 | 0.15 |
| 0.02 | 0.15 |
| 0.02 | 0.15 |
| 0.02 | 0.15 |
| 0.05 | 0.15 |
| 0.05 | 0.15 |
| 0.05 | 0.15 |
| 0.05 | 0.15 |
| 0.05 | 0.15 |
| 0.05 | 0.15 |
| 0.05 | 0.15 |
| 0.05 | 0.15 |
| 0.05 | 0.15 |
| 0.05 | 0.15 |
| 0.05 | 0.15 |
| 0.05 | 0.15 |
| 0.07 | 0.13 |
| 0.07 | 0.13 |
| 0.07 | 0.13 |
| 0.07 | 0.13 |
| 0.07 | 0.13 |
| 0.07 | 0.13 |
| 0.09 | 0.11 |
| 0.09 | 0.11 |
| 0.09 | 0.11 |
| 0.09 | 0.11 |
| 0.09 | 0.11 |
| 0.09 | 0.11 |
| 0.11 | 0.09 |
| 0.11 | 0.09 |
| 0.11 | 0.09 |
| 0.11 | 0.09 |
| 0.11 | 0.09 |
| 0.11 | 0.09 |
| 0.11 | 0.09 |
| 0.11 | 0.09 |
| 0.11 | 0.09 |
| 0.11 | 0.09 |
| 0.11 | 0.09 |
| 0.11 | 0.09 |
| 0.12 | 0.06 |
| 0.12 | 0.06 |
| 0.12 | 0.06 |
| 0.12 | 0.06 |
| 0.12 | 0.06 |
| 0.12 | 0.06 |
| 0.13 | 0.03 |
| 0.13 | 0.03 |
| 0.13 | 0.03 |
| 0.13 | 0.03 |
| 0.13 | 0.03 |
| 0.13 | 0.03 |
| 0.13 | 0.03 |
| 0.13 | 0.03 |
| 0.13 | 0.03 |
| 0.13 | 0.03 |
| 0.13 | 0.03 |
| 0.13 | 0.03 |
| 0.13 | -0.01 |
| 0.13 | -0.01 |
| 0.13 | -0.01 |
| 0.13 | -0.01 |
| 0.13 | -0.01 |
| 0.13 | -0.01 |
| 0.12 | -0.04 |
| 0.12 | -0.04 |
| 0.12 | -0.04 |
| 0.12 | -0.04 |
| 0.12 | -0.04 |
| 0.12 | -0.04 |
| 0.11 | -0.07 |
| 0.11 | -0.07 |
| 0.11 | -0.07 |
| 0.11 | -0.07 |
| 0.11 | -0.07 |
| 0.11 | -0.07 |
| 0.11 | -0.07 |
| 0.11 | -0.07 |
| 0.11 | -0.07 |
| 0.11 | -0.07 |
| 0.11 | -0.07 |
| 0.11 | -0.07 |
| 0.08 | -0.1 |
| 0.08 | -0.1 |
| 0.08 | -0.1 |
| 0.08 | -0.1 |
| 0.08 | -0.1 |
| 0.08 | -0.1 |
| 0.07 | -0.13 |
| 0.07 | -0.13 |
| 0.07 | -0.13 |
| 0.07 | -0.13 |
| 0.07 | -0.13 |
| 0.07 | -0.13 |
| 0.05 | -0.15 |
| 0.05 | -0.15 |
| 0.05 | -0.15 |
| 0.05 | -0.15 |
| 0.05 | -0.15 |
| 0.05 | -0.15 |
| 0.05 | -0.15 |
| 0.05 | -0.15 |
| 0.05 | -0.15 |
| 0.05 | -0.15 |
| 0.05 | -0.15 |
| 0.05 | -0.15 |
| 0.03 | -0.16 |
| 0.03 | -0.16 |
| 0.03 | -0.16 |
| 0.03 | -0.16 |
| 0.03 | -0.16 |
| 0.03 | -0.16 |
| 0.0 | -0.16 |
| 0.0 | -0.16 |
| 0.0 | -0.16 |
| 0.0 | -0.16 |
| 0.0 | -0.16 |
| 0.0 | -0.16 |
| -0.01 | -0.17 |
| -0.01 | -0.17 |
| -0.01 | -0.17 |
| -0.01 | -0.17 |
| -0.01 | -0.17 |
| -0.01 | -0.17 |
| -0.01 | -0.17 |
| -0.01 | -0.17 |
| -0.01 | -0.17 |
| -0.01 | -0.17 |
| -0.01 | -0.17 |
| -0.01 | -0.17 |
| -0.01 | -0.17 |
| -0.01 | -0.17 |
| -0.01 | -0.17 |
| -0.01 | -0.17 |
| -0.01 | -0.17 |
| -0.01 | -0.17 |
| -0.01 | -0.16 |
| -0.01 | -0.16 |
| -0.01 | -0.16 |
| -0.01 | -0.16 |
| -0.01 | -0.16 |
| -0.01 | -0.16 |
| -0.01 | -0.16 |
| -0.01 | -0.16 |
| -0.01 | -0.16 |
| -0.01 | -0.16 |
| -0.01 | -0.16 |
| -0.01 | -0.16 |
| 0.02 | -0.13 |
| 0.02 | -0.13 |
| 0.02 | -0.13 |
| 0.02 | -0.13 |
| 0.02 | -0.13 |
| 0.02 | -0.13 |
| 0.04 | -0.11 |
| 0.04 | -0.11 |
| 0.04 | -0.11 |
| 0.04 | -0.11 |
| 0.04 | -0.11 |
| 0.04 | -0.11 |
| 0.04 | -0.11 |
| 0.04 | -0.11 |
| 0.04 | -0.11 |
| 0.04 | -0.11 |
| 0.04 | -0.11 |
| 0.04 | -0.11 |
| 0.04 | -0.11 |
| 0.04 | -0.11 |
| 0.04 | -0.11 |
| 0.04 | -0.11 |
| 0.04 | -0.11 |
| 0.04 | -0.11 |
| 0.04 | -0.11 |
| 0.04 | -0.11 |
| 0.04 | -0.11 |
| 0.04 | -0.11 |
| 0.04 | -0.11 |
| 0.04 | -0.11 |
| 0.05 | -0.11 |
| 0.05 | -0.11 |
| 0.05 | -0.11 |
| 0.05 | -0.11 |
| 0.05 | -0.11 |
| 0.05 | -0.11 |
| 0.02 | -0.12 |
| 0.02 | -0.12 |
| 0.02 | -0.12 |
| 0.02 | -0.12 |
| 0.02 | -0.12 |
| 0.02 | -0.12 |
| 0.02 | -0.12 |
| 0.02 | -0.12 |
| 0.02 | -0.12 |
| 0.02 | -0.12 |
| 0.02 | -0.12 |
| 0.02 | -0.12 |
| 0.02 | -0.12 |
| 0.02 | -0.12 |
| 0.02 | -0.12 |
| 0.02 | -0.12 |
| 0.02 | -0.12 |
| 0.02 | -0.12 |
| 0.02 | -0.12 |
| 0.02 | -0.12 |
| 0.02 | -0.12 |
| 0.02 | -0.12 |
| 0.02 | -0.12 |
| 0.02 | -0.12 |
| 0.02 | -0.12 |
| 0.02 | -0.12 |
| 0.02 | -0.12 |
| 0.02 | -0.12 |
| 0.02 | -0.12 |
| 0.02 | -0.12 |
| 0.02 | -0.12 |
| 0.02 | -0.12 |
| 0.02 | -0.12 |
| 0.02 | -0.12 |
| 0.02 | -0.12 |
| 0.02 | -0.12 |
| 0.02 | -0.12 |
| 0.02 | -0.12 |
| 0.02 | -0.12 |
| 0.02 | -0.12 |
| 0.02 | -0.12 |
| 0.02 | -0.12 |
| 0.02 | -0.12 |
| 0.02 | -0.12 |
| 0.02 | -0.12 |
| 0.02 | -0.12 |
| 0.02 | -0.12 |
| 0.02 | -0.12 |
| 0.02 | -0.12 |
| 0.02 | -0.12 |
| 0.02 | -0.12 |
| 0.02 | -0.12 |
| 0.02 | -0.12 |
| 0.02 | -0.12 |
| 0.02 | -0.12 |
| 0.02 | -0.12 |
| 0.02 | -0.12 |
| 0.02 | -0.12 |
| 0.02 | -0.12 |
| 0.02 | -0.12 |
| 0.02 | -0.12 |
| 0.02 | -0.12 |
| 0.02 | -0.12 |
| 0.02 | -0.12 |
| 0.02 | -0.12 |
| 0.02 | -0.12 |
| 0.02 | -0.12 |
| 0.02 | -0.12 |
| 0.02 | -0.12 |
| 0.02 | -0.12 |
| 0.02 | -0.12 |
| 0.02 | -0.12 |
| 0.02 | -0.12 |
| 0.02 | -0.12 |
| 0.02 | -0.12 |
| 0.02 | -0.12 |
| 0.02 | -0.12 |
| 0.02 | -0.12 |
| 0.02 | -0.12 |
| 0.02 | -0.12 |
| 0.02 | -0.12 |
| 0.02 | -0.12 |
| 0.02 | -0.12 |
| 0.02 | -0.12 |
| 0.02 | -0.12 |
| 0.02 | -0.12 |
| 0.02 | -0.12 |
| 0.02 | -0.12 |
| 0.02 | -0.12 |
| 0.02 | -0.12 |
| 0.02 | -0.12 |
| 0.02 | -0.12 |
| 0.02 | -0.12 |
| 0.02 | -0.12 |
| 0.02 | -0.12 |
| 0.02 | -0.12 |
| 0.02 | -0.12 |
| 0.02 | -0.12 |
| 0.02 | -0.12 |
| 0.02 | -0.12 |
| 0.02 | -0.12 |
| 0.02 | -0.12 |
| 0.02 | -0.12 |
| 0.02 | -0.12 |
| 0.02 | -0.12 |
| 0.02 | -0.12 |
| 0.02 | -0.12 |
| 0.02 | -0.12 |
| 0.02 | -0.12 |
| 0.02 | -0.12 |
| 0.02 | -0.12 |
| 0.02 | -0.12 |
| 0.02 | -0.12 |
| 0.02 | -0.12 |
| 0.02 | -0.12 |
| 0.02 | -0.12 |
| 0.02 | -0.12 |
| 0.02 | -0.12 |
| 0.02 | -0.12 |
| 0.02 | -0.12 |
| 0.02 | -0.12 |
| 0.02 | -0.12 |
| 0.02 | -0.12 |
| 0.02 | -0.12 |
| 0.02 | -0.12 |
| 0.02 | -0.12 |
| 0.02 | -0.12 |
| 0.02 | -0.12 |
| 0.02 | -0.12 |
| 0.02 | -0.12 |
| 0.02 | -0.12 |
| 0.02 | -0.12 |
| 0.02 | -0.12 |
| 0.02 | -0.12 |
| 0.02 | -0.12 |
| 0.02 | -0.12 |
| 0.02 | -0.12 |
| 0.02 | -0.12 |
| 0.02 | -0.12 |
| 0.02 | -0.12 |
| 0.02 | -0.12 |
| 0.02 | -0.12 |
| 0.02 | -0.12 |
| 0.02 | -0.12 |
| 0.02 | -0.12 |
| 0.02 | -0.12 |
| 0.02 | -0.12 |
| 0.02 | -0.12 |
| 0.02 | -0.12 |
| 0.02 | -0.12 |
| 0.02 | -0.12 |
| 0.02 | -0.12 |
| 0.02 | -0.12 |
| 0.02 | -0.12 |
| 0.02 | -0.12 |
| 0.02 | -0.12 |
| 0.02 | -0.12 |
| 0.02 | -0.12 |
| 0.02 | -0.12 |
| 0.02 | -0.12 |
| 0.02 | -0.12 |
| 0.02 | -0.12 |
| 0.02 | -0.12 |
| 0.02 | -0.12 |
| 0.02 | -0.12 |
| 0.02 | -0.12 |
| 0.02 | -0.12 |
| 0.02 | -0.12 |
| 0.02 | -0.12 |
| 0.02 | -0.12 |
| 0.02 | -0.12 |
| 0.02 | -0.12 |
| 0.02 | -0.12 |
| 0.02 | -0.12 |
| 0.02 | -0.12 |
| 0.02 | -0.12 |
| 0.02 | -0.12 |
| 0.02 | -0.12 |
| 0.02 | -0.12 |
| 0.02 | -0.12 |
| 0.02 | -0.12 |
| 0.02 | -0.12 |
| 0.02 | -0.12 |
| 0.02 | -0.12 |
| 0.02 | -0.12 |
| 0.02 | -0.12 |
| 0.02 | -0.12 |
| 0.02 | -0.12 |
| 0.02 | -0.12 |
| 0.02 | -0.12 |
| 0.02 | -0.12 |
| 0.02 | -0.12 |
| 0.02 | -0.12 |
| 0.02 | -0.12 |
| 0.02 | -0.12 |
| 0.02 | -0.12 |
| 0.02 | -0.12 |
| 0.02 | -0.12 |
| 0.02 | -0.12 |
| 0.02 | -0.12 |
| 0.02 | -0.12 |
| 0.02 | -0.12 |
| 0.02 | -0.12 |
| 0.02 | -0.12 |
| 0.02 | -0.12 |
| 0.02 | -0.12 |
| 0.02 | -0.12 |
| 0.02 | -0.12 |
| 0.02 | -0.12 |
| 0.02 | -0.12 |
| 0.02 | -0.12 |
| 0.02 | -0.12 |
| 0.02 | -0.12 |
| 0.02 | -0.12 |
| 0.02 | -0.12 |
| 0.02 | -0.12 |
| 0.02 | -0.12 |
| 0.02 | -0.12 |
| 0.02 | -0.12 |
| 0.02 | -0.12 |
| 0.02 | -0.12 |
| 0.02 | -0.12 |
| 0.02 | -0.12 |
| 0.02 | -0.12 |
| 0.02 | -0.12 |
| 0.02 | -0.12 |
| 0.02 | -0.12 |
| 0.02 | -0.12 |
| 0.02 | -0.12 |
| 0.02 | -0.12 |
| 0.02 | -0.12 |
| 0.02 | -0.12 |
| 0.02 | -0.12 |
| 0.02 | -0.12 |
| 0.02 | -0.12 |
| 0.02 | -0.12 |
| 0.02 | -0.12 |
| 0.02 | -0.12 |
| 0.02 | -0.12 |
| 0.02 | -0.12 |
| 0.02 | -0.12 |
| 0.02 | -0.12 |
| 0.02 | -0.12 |
| 0.02 | -0.12 |
| 0.02 | -0.12 |
| 0.02 | -0.12 |
| 0.02 | -0.12 |
| 0.02 | -0.12 |
| 0.02 | -0.12 |
| 0.02 | -0.12 |
| 0.02 | -0.12 |
| 0.02 | -0.12 |
| 0.02 | -0.12 |
| 0.02 | -0.12 |
| 0.02 | -0.12 |
| 0.02 | -0.12 |
| 0.02 | -0.12 |
| 0.02 | -0.12 |
| 0.02 | -0.12 |
| 0.02 | -0.12 |
| 0.02 | -0.12 |
| 0.02 | -0.12 |
| 0.02 | -0.12 |
| 0.02 | -0.12 |
| 0.02 | -0.12 |
| 0.02 | -0.12 |
| 0.02 | -0.12 |
| 0.02 | -0.12 |
| 0.02 | -0.12 |
| 0.02 | -0.12 |
| 0.02 | -0.12 |
| 0.02 | -0.12 |
| 0.02 | -0.12 |
| 0.02 | -0.12 |
| 0.02 | -0.12 |
| 0.02 | -0.12 |
| 0.02 | -0.12 |
| 0.02 | -0.12 |
| 0.02 | -0.12 |
| 0.02 | -0.12 |
| 0.02 | -0.12 |
| 0.02 | -0.12 |
| 0.02 | -0.12 |
| 0.02 | -0.12 |
| 0.02 | -0.12 |
| 0.02 | -0.12 |
| 0.02 | -0.12 |
| 0.02 | -0.12 |
| 0.02 | -0.12 |
| 0.02 | -0.12 |
| 0.02 | -0.12 |
| 0.02 | -0.12 |
| 0.02 | -0.12 |
| 0.02 | -0.12 |
| 0.02 | -0.12 |
| 0.02 | -0.12 |
| 0.02 | -0.12 |
| 0.02 | -0.12 |
| 0.02 | -0.12 |
| 0.02 | -0.12 |
| 0.02 | -0.12 |
| 0.02 | -0.12 |
| 0.02 | -0.12 |
| 0.02 | -0.12 |
| 0.02 | -0.12 |
| 0.02 | -0.12 |
| 0.02 | -0.12 |
| 0.02 | -0.12 |
| 0.02 | -0.12 |
| 0.02 | -0.12 |
| 0.02 | -0.12 |
| 0.02 | -0.12 |
| 0.02 | -0.12 |
| 0.02 | -0.12 |
| 0.02 | -0.12 |
| 0.02 | -0.12 |
| 0.02 | -0.12 |
| 0.02 | -0.12 |
| 0.02 | -0.12 |
| 0.02 | -0.12 |
| 0.02 | -0.12 |
| 0.02 | -0.12 |
| 0.02 | -0.12 |
| 0.02 | -0.12 |
| 0.02 | -0.12 |
| 0.02 | -0.12 |
| 0.02 | -0.12 |
| 0.02 | -0.12 |
| 0.02 | -0.12 |
| 0.02 | -0.12 |
| 0.02 | -0.12 |
| 0.02 | -0.12 |
| 0.02 | -0.12 |
| 0.02 | -0.12 |
| 0.02 | -0.12 |
| 0.02 | -0.12 |
| 0.02 | -0.12 |
| 0.02 | -0.12 |
| 0.02 | -0.12 |
| 0.02 | -0.12 |
| 0.02 | -0.12 |
| 0.02 | -0.12 |
| 0.02 | -0.12 |
| 0.02 | -0.12 |
| 0.02 | -0.12 |
| 0.02 | -0.12 |
| 0.02 | -0.12 |
| 0.02 | -0.12 |
| 0.02 | -0.12 |
| 0.02 | -0.12 |
| 0.02 | -0.12 |
| 0.02 | -0.12 |
| 0.02 | -0.12 |
| 0.02 | -0.12 |
| 0.02 | -0.12 |
| 0.02 | -0.12 |
| 0.02 | -0.12 |
| 0.02 | -0.12 |
| 0.02 | -0.12 |
| 0.02 | -0.12 |
| 0.02 | -0.12 |
| 0.02 | -0.12 |
| 0.02 | -0.12 |
| 0.02 | -0.12 |
| 0.02 | -0.12 |
| 0.02 | -0.12 |
| 0.02 | -0.12 |
| 0.02 | -0.12 |
| 0.02 | -0.12 |
| 0.02 | -0.12 |
| 0.02 | -0.12 |
| 0.02 | -0.12 |
| 0.02 | -0.12 |
| 0.02 | -0.12 |
| 0.02 | -0.12 |
| 0.02 | -0.12 |
| 0.02 | -0.12 |
| 0.02 | -0.12 |
| 0.02 | -0.12 |
| 0.02 | -0.12 |
| 0.02 | -0.12 |
| 0.02 | -0.12 |
| 0.02 | -0.12 |
| 0.02 | -0.12 |
| 0.02 | -0.12 |
| 0.02 | -0.12 |
| 0.02 | -0.12 |
| 0.02 | -0.12 |
| 0.02 | -0.12 |
| 0.02 | -0.12 |
| 0.02 | -0.12 |
| 0.02 | -0.12 |
| 0.02 | -0.12 |
| 0.02 | -0.12 |
| 0.02 | -0.12 |
| 0.02 | -0.12 |
| 0.02 | -0.12 |
| 0.02 | -0.12 |
| 0.02 | -0.12 |
| 0.02 | -0.12 |
| 0.02 | -0.12 |
| 0.02 | -0.12 |
| 0.02 | -0.12 |
| 0.02 | -0.12 |
| 0.02 | -0.12 |
| 0.02 | -0.12 |
| 0.02 | -0.12 |
| 0.02 | -0.12 |
| 0.02 | -0.12 |
| 0.02 | -0.12 |
| 0.02 | -0.12 |
| 0.02 | -0.12 |
| 0.02 | -0.12 |
| 0.02 | -0.12 |
| 0.02 | -0.12 |
| 0.02 | -0.12 |
| 0.02 | -0.12 |
| 0.02 | -0.12 |
| 0.02 | -0.12 |
| 0.02 | -0.12 |
| 0.02 | -0.12 |
| 0.02 | -0.12 |
| 0.02 | -0.12 |
| 0.02 | -0.12 |
| 0.02 | -0.12 |
| 0.02 | -0.12 |
| 0.02 | -0.12 |
| 0.02 | -0.12 |
| 0.02 | -0.12 |
| 0.02 | -0.12 |
| 0.02 | -0.12 |
| 0.02 | -0.12 |
| 0.02 | -0.12 |
| 0.02 | -0.12 |
| 0.02 | -0.12 |
| 0.02 | -0.12 |
| 0.02 | -0.12 |
| 0.02 | -0.12 |
| 0.02 | -0.12 |
| 0.02 | -0.12 |
| 0.02 | -0.12 |
| 0.02 | -0.12 |
| 0.02 | -0.12 |
| 0.02 | -0.12 |
| 0.02 | -0.12 |
| 0.02 | -0.12 |
| 0.02 | -0.12 |
| 0.02 | -0.12 |
| 0.02 | -0.12 |
| 0.02 | -0.12 |
| 0.02 | -0.12 |
| 0.02 | -0.12 |
| 0.02 | -0.12 |
| 0.02 | -0.12 |
| 0.02 | -0.12 |
| 0.02 | -0.12 |
| 0.02 | -0.12 |
| 0.02 | -0.12 |
| 0.02 | -0.12 |
| 0.02 | -0.12 |
| 0.02 | -0.12 |
| 0.02 | -0.12 |
| 0.02 | -0.12 |
| 0.02 | -0.12 |
| 0.02 | -0.12 |
| 0.02 | -0.12 |
| 0.02 | -0.12 |
| 0.02 | -0.12 |
| 0.02 | -0.12 |
| 0.02 | -0.12 |
| 0.02 | -0.12 |
| 0.02 | -0.12 |
| 0.02 | -0.12 |
| 0.02 | -0.12 |
| 0.02 | -0.12 |
| 0.02 | -0.12 |
| 0.02 | -0.12 |
| 0.02 | -0.12 |
| 0.02 | -0.12 |
| 0.02 | -0.12 |
| 0.02 | -0.12 |
| 0.02 | -0.12 |
| 0.02 | -0.12 |
| 0.02 | -0.12 |
| 0.02 | -0.12 |
| 0.02 | -0.12 |
| 0.02 | -0.12 |
| 0.02 | -0.12 |
| 0.02 | -0.12 |
| 0.02 | -0.12 |
| 0.02 | -0.12 |
| 0.02 | -0.12 |
| 0.02 | -0.12 |
| 0.02 | -0.12 |
| 0.02 | -0.12 |
| 0.02 | -0.12 |
| 0.02 | -0.12 |
| 0.02 | -0.12 |
| 0.02 | -0.12 |
| 0.02 | -0.12 |
| 0.02 | -0.12 |
| 0.02 | -0.12 |
| 0.02 | -0.12 |
| 0.02 | -0.12 |
| 0.02 | -0.12 |
| 0.02 | -0.12 |
| 0.02 | -0.12 |
| 0.02 | -0.12 |
| 0.02 | -0.12 |
| 0.02 | -0.12 |
| 0.02 | -0.12 |
| 0.02 | -0.12 |
| 0.02 | -0.12 |
| 0.02 | -0.12 |
| 0.02 | -0.12 |
| 0.02 | -0.12 |
| 0.02 | -0.12 |
| 0.02 | -0.12 |
| 0.02 | -0.12 |
| 0.02 | -0.12 |
| 0.02 | -0.12 |
| 0.02 | -0.12 |
| 0.02 | -0.12 |
| 0.02 | -0.12 |
| 0.02 | -0.12 |
| 0.02 | -0.12 |
| 0.02 | -0.12 |
| 0.02 | -0.12 |
| 0.02 | -0.12 |
| 0.02 | -0.12 |
| 0.02 | -0.12 |
| 0.02 | -0.12 |
| 0.02 | -0.12 |
| 0.02 | -0.12 |
| 0.02 | -0.12 |
| 0.02 | -0.12 |
| 0.02 | -0.12 |
| 0.02 | -0.12 |
| 0.02 | -0.12 |
| 0.02 | -0.12 |
| 0.02 | -0.12 |
| 0.02 | -0.12 |
| 0.02 | -0.12 |
| 0.02 | -0.12 |
| 0.02 | -0.12 |
| 0.02 | -0.12 |
| 0.02 | -0.12 |
| 0.02 | -0.12 |
| 0.02 | -0.12 |
| 0.02 | -0.12 |
| 0.02 | -0.12 |
| 0.02 | -0.12 |
| 0.02 | -0.12 |
| 0.02 | -0.12 |
| 0.02 | -0.12 |
| 0.02 | -0.12 |
| 0.02 | -0.12 |
| 0.02 | -0.12 |
| 0.02 | -0.12 |
| 0.02 | -0.12 |
| 0.02 | -0.12 |
| 0.02 | -0.12 |
| 0.02 | -0.12 |
| 0.02 | -0.12 |
| 0.02 | -0.12 |
| 0.02 | -0.12 |
| 0.02 | -0.12 |
| 0.02 | -0.12 |
| 0.02 | -0.12 |
| 0.02 | -0.12 |
| 0.02 | -0.12 |
| 0.02 | -0.12 |
| 0.02 | -0.12 |
| 0.02 | -0.12 |
| 0.02 | -0.12 |
| 0.02 | -0.12 |
| 0.02 | -0.12 |
| 0.02 | -0.12 |
| 0.02 | -0.12 |
| 0.02 | -0.12 |
| 0.02 | -0.12 |
| 0.02 | -0.12 |
| 0.02 | -0.12 |
| 0.02 | -0.12 |
| 0.02 | -0.12 |
| 0.02 | -0.12 |
| 0.02 | -0.12 |
| 0.02 | -0.12 |
| 0.02 | -0.12 |
| 0.02 | -0.12 |
| 0.02 | -0.12 |
| 0.02 | -0.12 |
| 0.02 | -0.12 |
| 0.02 | -0.12 |
| 0.02 | -0.12 |
| 0.02 | -0.12 |
| 0.02 | -0.12 |
| 0.02 | -0.12 |
| 0.02 | -0.12 |
| 0.02 | -0.12 |
| 0.02 | -0.12 |
| 0.02 | -0.12 |
| 0.02 | -0.12 |
| 0.02 | -0.12 |
| 0.02 | -0.12 |
| 0.02 | -0.12 |
| 0.02 | -0.12 |
| 0.02 | -0.12 |
| 0.02 | -0.12 |
| 0.02 | -0.12 |
| 0.02 | -0.12 |
| 0.02 | -0.12 |
| 0.02 | -0.12 |
| 0.02 | -0.12 |
| 0.02 | -0.12 |
| 0.02 | -0.12 |
| 0.02 | -0.12 |
| 0.02 | -0.12 |
| 0.02 | -0.12 |
| 0.02 | -0.12 |
| 0.02 | -0.12 |
| 0.02 | -0.12 |
| 0.02 | -0.12 |
| 0.02 | -0.12 |
| 0.02 | -0.12 |
| 0.02 | -0.12 |
| 0.02 | -0.12 |
| 0.02 | -0.12 |
| 0.02 | -0.12 |
| 0.02 | -0.12 |
| 0.02 | -0.12 |
| 0.02 | -0.12 |
| 0.02 | -0.12 |
| 0.02 | -0.12 |
| 0.02 | -0.12 |
| 0.02 | -0.12 |
| 0.02 | -0.12 |
| 0.02 | -0.12 |
| 0.02 | -0.12 |
| 0.02 | -0.12 |
| 0.02 | -0.12 |
| 0.02 | -0.12 |
| 0.02 | -0.12 |
| 0.02 | -0.12 |
| 0.02 | -0.12 |
| 0.02 | -0.12 |
| 0.02 | -0.12 |
| 0.02 | -0.12 |
| 0.02 | -0.12 |
| 0.02 | -0.12 |
| 0.02 | -0.12 |
| 0.02 | -0.12 |
| 0.02 | -0.12 |
| 0.02 | -0.12 |
| 0.02 | -0.12 |
| 0.02 | -0.12 |
| 0.02 | -0.12 |
| 0.02 | -0.12 |
| 0.02 | -0.12 |
| 0.02 | -0.12 |
| 0.02 | -0.12 |
| 0.02 | -0.12 |
| 0.02 | -0.12 |
| 0.02 | -0.12 |
| 0.02 | -0.12 |
| 0.02 | -0.12 |
| 0.02 | -0.12 |
| 0.02 | -0.12 |
| 0.02 | -0.12 |
| 0.02 | -0.12 |
| 0.02 | -0.12 |
| 0.02 | -0.12 |
| 0.02 | -0.12 |
| 0.02 | -0.12 |
| 0.02 | -0.12 |
| 0.02 | -0.12 |
| 0.02 | -0.12 |
| 0.02 | -0.12 |
| 0.02 | -0.12 |
| 0.02 | -0.12 |
| 0.02 | -0.12 |
| 0.02 | -0.12 |
| 0.02 | -0.12 |
| 0.02 | -0.12 |
| 0.02 | -0.12 |
| 0.02 | -0.12 |
| 0.02 | -0.12 |
| 0.02 | -0.12 |
| 0.02 | -0.12 |
| 0.02 | -0.12 |
| 0.02 | -0.12 |
| 0.02 | -0.12 |
| 0.02 | -0.12 |
| 0.02 | -0.12 |
| 0.02 | -0.12 |
| 0.02 | -0.12 |
| 0.02 | -0.12 |
| 0.02 | -0.12 |
| 0.02 | -0.12 |
| 0.02 | -0.12 |
| 0.02 | -0.12 |
| 0.02 | -0.12 |
| 0.02 | -0.12 |
| 0.02 | -0.12 |
| 0.02 | -0.12 |
| 0.02 | -0.12 |
| 0.02 | -0.12 |
| 0.02 | -0.12 |
| 0.02 | -0.12 |
| 0.02 | -0.12 |
| 0.02 | -0.12 |
| 0.02 | -0.12 |
| 0.02 | -0.12 |
| 0.02 | -0.12 |
| 0.02 | -0.12 |
| 0.02 | -0.12 |
| 0.02 | -0.12 |
| 0.02 | -0.12 |
| 0.02 | -0.12 |
| 0.02 | -0.12 |
| 0.02 | -0.13 |
| 0.02 | -0.13 |
| 0.02 | -0.13 |
| 0.02 | -0.13 |
| 0.02 | -0.13 |
| 0.02 | -0.13 |
| 0.02 | -0.12 |
| 0.02 | -0.12 |
| 0.02 | -0.12 |
| 0.02 | -0.12 |
| 0.02 | -0.12 |
| 0.02 | -0.12 |
| 0.02 | -0.12 |
| 0.02 | -0.12 |
| 0.02 | -0.12 |
| 0.02 | -0.12 |
| 0.02 | -0.12 |
| 0.02 | -0.12 |
| 0.02 | -0.12 |
| 0.02 | -0.12 |
| 0.02 | -0.12 |
| 0.02 | -0.12 |
| 0.02 | -0.12 |
| 0.02 | -0.12 |
| 0.02 | -0.12 |
| 0.02 | -0.12 |
| 0.02 | -0.12 |
| 0.02 | -0.12 |
| 0.02 | -0.12 |
| 0.02 | -0.12 |
| 0.02 | -0.12 |
| 0.02 | -0.12 |
| 0.02 | -0.12 |
| 0.02 | -0.12 |
| 0.02 | -0.12 |
| 0.02 | -0.12 |
| 0.02 | -0.12 |
| 0.02 | -0.12 |
| 0.02 | -0.12 |
| 0.02 | -0.12 |
| 0.02 | -0.12 |
| 0.02 | -0.12 |
| 0.02 | -0.12 |
| 0.02 | -0.12 |
| 0.02 | -0.12 |
| 0.02 | -0.12 |
| 0.02 | -0.12 |
| 0.02 | -0.12 |
| 0.02 | -0.12 |
| 0.02 | -0.12 |
| 0.02 | -0.12 |
| 0.02 | -0.12 |
| 0.02 | -0.12 |
| 0.02 | -0.12 |
| 0.02 | -0.12 |
| 0.02 | -0.12 |
| 0.02 | -0.12 |
| 0.02 | -0.12 |
| 0.02 | -0.12 |
| 0.02 | -0.12 |
| 0.02 | -0.12 |
| 0.02 | -0.12 |
| 0.02 | -0.12 |
| 0.02 | -0.12 |
| 0.02 | -0.12 |
| 0.02 | -0.12 |
| 0.02 | -0.12 |
| 0.02 | -0.12 |
| 0.02 | -0.12 |
| 0.02 | -0.12 |
| 0.02 | -0.12 |
| 0.02 | -0.12 |
| 0.02 | -0.12 |
| 0.02 | -0.12 |
| 0.02 | -0.12 |
| 0.02 | -0.12 |
| 0.02 | -0.12 |
| 0.02 | -0.12 |
| 0.02 | -0.13 |
| 0.02 | -0.13 |
| 0.02 | -0.13 |
| 0.02 | -0.13 |
| 0.02 | -0.13 |
| 0.02 | -0.13 |
| 0.02 | -0.13 |
| 0.02 | -0.13 |
| 0.02 | -0.13 |
| 0.02 | -0.13 |
| 0.02 | -0.13 |
| 0.02 | -0.13 |
| 0.02 | -0.12 |
| 0.02 | -0.12 |
| 0.02 | -0.12 |
| 0.02 | -0.12 |
| 0.02 | -0.12 |
| 0.02 | -0.12 |
| 0.02 | -0.12 |
| 0.02 | -0.12 |
| 0.02 | -0.12 |
| 0.02 | -0.12 |
| 0.02 | -0.12 |
| 0.02 | -0.12 |
| 0.02 | -0.13 |
| 0.02 | -0.13 |
| 0.02 | -0.13 |
| 0.02 | -0.13 |
| 0.02 | -0.13 |
| 0.02 | -0.13 |
| 0.02 | -0.13 |
| 0.02 | -0.13 |
| 0.02 | -0.13 |
| 0.02 | -0.13 |
| 0.02 | -0.13 |
| 0.02 | -0.13 |
| 0.02 | -0.12 |
| 0.02 | -0.12 |
| 0.02 | -0.12 |
| 0.02 | -0.12 |
| 0.02 | -0.12 |
| 0.02 | -0.12 |
| 0.02 | -0.13 |
| 0.02 | -0.13 |
| 0.02 | -0.13 |
| 0.02 | -0.13 |
| 0.02 | -0.13 |
| 0.02 | -0.13 |
| 0.02 | -0.13 |
| 0.02 | -0.13 |
| 0.02 | -0.13 |
| 0.02 | -0.13 |
| 0.02 | -0.13 |
| 0.02 | -0.13 |
| 0.02 | -0.13 |
| 0.02 | -0.13 |
| 0.02 | -0.13 |
| 0.02 | -0.13 |
| 0.02 | -0.13 |
| 0.02 | -0.13 |
| 0.02 | -0.13 |
| 0.02 | -0.13 |
| 0.02 | -0.13 |
| 0.02 | -0.13 |
| 0.02 | -0.13 |
| 0.02 | -0.13 |
| 0.02 | -0.13 |
| 0.02 | -0.13 |
| 0.02 | -0.13 |
| 0.02 | -0.13 |
| 0.02 | -0.13 |
| 0.02 | -0.13 |
| 0.02 | -0.13 |
| 0.02 | -0.13 |
| 0.02 | -0.13 |
| 0.02 | -0.13 |
| 0.02 | -0.13 |
| 0.02 | -0.13 |
| 0.02 | -0.13 |
| 0.02 | -0.13 |
| 0.02 | -0.13 |
| 0.02 | -0.13 |
| 0.02 | -0.13 |
| 0.02 | -0.13 |
| 0.02 | -0.13 |
| 0.02 | -0.13 |
| 0.02 | -0.13 |
| 0.02 | -0.13 |
| 0.02 | -0.13 |
| 0.02 | -0.13 |
| 0.02 | -0.13 |
| 0.02 | -0.13 |
| 0.02 | -0.13 |
| 0.02 | -0.13 |
| 0.02 | -0.13 |
| 0.02 | -0.13 |
| 0.02 | -0.13 |
| 0.02 | -0.13 |
| 0.02 | -0.13 |
| 0.02 | -0.13 |
| 0.02 | -0.13 |
| 0.02 | -0.13 |
| 0.02 | -0.13 |
| 0.02 | -0.13 |
| 0.02 | -0.13 |
| 0.02 | -0.13 |
| 0.02 | -0.13 |
| 0.02 | -0.13 |
| 0.02 | -0.13 |
| 0.02 | -0.13 |
| 0.02 | -0.13 |
| 0.02 | -0.13 |
| 0.02 | -0.13 |
| 0.02 | -0.13 |
| 0.02 | -0.13 |
| 0.02 | -0.13 |
| 0.02 | -0.13 |
| 0.02 | -0.13 |
| 0.02 | -0.13 |
| 0.02 | -0.13 |
| 0.02 | -0.13 |
| 0.02 | -0.13 |
| 0.02 | -0.13 |
| 0.02 | -0.13 |
| 0.02 | -0.13 |
| 0.02 | -0.13 |
| 0.02 | -0.13 |
| 0.02 | -0.13 |
| 0.02 | -0.13 |
| 0.02 | -0.13 |
| 0.02 | -0.13 |
| 0.02 | -0.13 |
| 0.02 | -0.13 |
| 0.02 | -0.13 |
| 0.02 | -0.13 |
| 0.02 | -0.13 |
| 0.02 | -0.13 |
| 0.02 | -0.13 |
| 0.02 | -0.13 |
| 0.02 | -0.13 |
| 0.02 | -0.13 |
| 0.02 | -0.13 |
| 0.02 | -0.13 |
| 0.02 | -0.13 |
| 0.02 | -0.13 |
| 0.02 | -0.13 |
| 0.02 | -0.13 |
| 0.02 | -0.13 |
| 0.02 | -0.13 |
| 0.02 | -0.13 |
| 0.02 | -0.12 |
| 0.02 | -0.12 |
| 0.02 | -0.12 |
| 0.02 | -0.12 |
| 0.02 | -0.12 |
| 0.02 | -0.12 |
| 0.02 | -0.13 |
| 0.02 | -0.13 |
| 0.02 | -0.13 |
| 0.02 | -0.13 |
| 0.02 | -0.13 |
| 0.02 | -0.13 |
| 0.02 | -0.13 |
| 0.02 | -0.13 |
| 0.02 | -0.13 |
| 0.02 | -0.13 |
| 0.02 | -0.13 |
| 0.02 | -0.13 |
| 0.02 | -0.13 |
| 0.02 | -0.13 |
| 0.02 | -0.13 |
| 0.02 | -0.13 |
| 0.02 | -0.13 |
| 0.02 | -0.13 |
| 0.02 | -0.13 |
| 0.02 | -0.13 |
| 0.02 | -0.13 |
| 0.02 | -0.13 |
| 0.02 | -0.13 |
| 0.02 | -0.13 |
| 0.02 | -0.13 |
| 0.02 | -0.13 |
| 0.02 | -0.13 |
| 0.02 | -0.13 |
| 0.02 | -0.13 |
| 0.02 | -0.13 |
| 0.02 | -0.13 |
| 0.02 | -0.13 |
| 0.02 | -0.13 |
| 0.02 | -0.13 |
| 0.02 | -0.13 |
| 0.02 | -0.13 |
| 0.02 | -0.12 |
| 0.02 | -0.12 |
| 0.02 | -0.12 |
| 0.02 | -0.12 |
| 0.02 | -0.12 |
| 0.02 | -0.12 |
| 0.02 | -0.13 |
| 0.02 | -0.13 |
| 0.02 | -0.13 |
| 0.02 | -0.13 |
| 0.02 | -0.13 |
| 0.02 | -0.13 |
| 0.02 | -0.13 |
| 0.02 | -0.13 |
| 0.02 | -0.13 |
| 0.02 | -0.13 |
| 0.02 | -0.13 |
| 0.02 | -0.13 |
| 0.02 | -0.13 |
| 0.02 | -0.13 |
| 0.02 | -0.13 |
| 0.02 | -0.13 |
| 0.02 | -0.13 |
| 0.02 | -0.13 |
| 0.02 | -0.13 |
| 0.02 | -0.13 |
| 0.02 | -0.13 |
| 0.02 | -0.13 |
| 0.02 | -0.13 |
| 0.02 | -0.13 |
| 0.02 | -0.13 |
| 0.02 | -0.13 |
| 0.02 | -0.13 |
| 0.02 | -0.13 |
| 0.02 | -0.13 |
| 0.02 | -0.13 |
| 0.02 | -0.13 |
| 0.02 | -0.13 |
| 0.02 | -0.13 |
| 0.02 | -0.13 |
| 0.02 | -0.13 |
| 0.02 | -0.13 |
| 0.02 | -0.13 |
| 0.02 | -0.13 |
| 0.02 | -0.13 |
| 0.02 | -0.13 |
| 0.02 | -0.13 |
| 0.02 | -0.13 |
| 0.02 | -0.13 |
| 0.02 | -0.13 |
| 0.02 | -0.13 |
| 0.02 | -0.13 |
| 0.02 | -0.13 |
| 0.02 | -0.13 |
| 0.02 | -0.13 |
| 0.02 | -0.13 |
| 0.02 | -0.13 |
| 0.02 | -0.13 |
| 0.02 | -0.13 |
| 0.02 | -0.13 |
| 0.02 | -0.13 |
| 0.02 | -0.13 |
| 0.02 | -0.13 |
| 0.02 | -0.13 |
| 0.02 | -0.13 |
| 0.02 | -0.13 |
| 0.02 | -0.13 |
| 0.02 | -0.13 |
| 0.02 | -0.13 |
| 0.02 | -0.13 |
| 0.02 | -0.13 |
| 0.02 | -0.13 |
| 0.02 | -0.13 |
| 0.02 | -0.13 |
| 0.02 | -0.13 |
| 0.02 | -0.13 |
| 0.02 | -0.13 |
| 0.02 | -0.13 |
| 0.02 | -0.13 |
| 0.02 | -0.13 |
| 0.02 | -0.13 |
| 0.02 | -0.13 |
| 0.02 | -0.13 |
| 0.02 | -0.13 |
| 0.02 | -0.13 |
| 0.02 | -0.13 |
| 0.02 | -0.13 |
| 0.02 | -0.13 |
| 0.02 | -0.13 |
| 0.02 | -0.13 |
| 0.02 | -0.13 |
| 0.02 | -0.13 |
| 0.02 | -0.13 |
| 0.02 | -0.13 |
| 0.02 | -0.13 |
| 0.02 | -0.13 |
| 0.02 | -0.13 |
| 0.02 | -0.13 |
| 0.02 | -0.13 |
| 0.02 | -0.13 |
| 0.02 | -0.13 |
| 0.02 | -0.13 |
| 0.02 | -0.13 |
| 0.02 | -0.13 |
| 0.02 | -0.13 |
| 0.02 | -0.13 |
| 0.02 | -0.13 |
| 0.02 | -0.13 |
| 0.02 | -0.13 |
| 0.02 | -0.13 |
| 0.02 | -0.13 |
| 0.02 | -0.13 |
| 0.02 | -0.13 |
| 0.02 | -0.13 |
| 0.02 | -0.13 |
| 0.02 | -0.13 |
| 0.02 | -0.13 |
| 0.02 | -0.13 |
| 0.02 | -0.13 |
| 0.02 | -0.13 |
| 0.02 | -0.13 |
| 0.02 | -0.13 |
| 0.02 | -0.13 |
| 0.02 | -0.13 |
| 0.02 | -0.13 |
| 0.02 | -0.13 |
| 0.02 | -0.13 |
| 0.02 | -0.13 |
| 0.02 | -0.13 |
| 0.02 | -0.13 |
| 0.02 | -0.13 |
| 0.02 | -0.13 |
| 0.02 | -0.13 |
| 0.02 | -0.13 |
| 0.02 | -0.13 |
| 0.02 | -0.13 |
| 0.02 | -0.13 |
| 0.02 | -0.13 |
| 0.02 | -0.13 |
| 0.02 | -0.13 |
| 0.02 | -0.13 |
| 0.02 | -0.13 |
| 0.02 | -0.13 |
| 0.02 | -0.13 |
| 0.02 | -0.13 |
| 0.02 | -0.13 |
| 0.02 | -0.13 |
| 0.02 | -0.13 |
| 0.02 | -0.13 |
| 0.02 | -0.13 |
| 0.02 | -0.13 |
| 0.02 | -0.13 |
| 0.02 | -0.13 |
| 0.02 | -0.13 |
| 0.02 | -0.13 |
| 0.02 | -0.13 |
| 0.02 | -0.13 |
| 0.02 | -0.13 |
| 0.02 | -0.13 |
| 0.02 | -0.13 |
| 0.02 | -0.13 |
| 0.02 | -0.13 |
| 0.02 | -0.13 |
| 0.02 | -0.13 |
| 0.02 | -0.13 |
| 0.02 | -0.13 |
| 0.02 | -0.13 |
| 0.02 | -0.13 |
| 0.02 | -0.13 |
| 0.02 | -0.13 |
| 0.02 | -0.13 |
| 0.02 | -0.13 |
| 0.02 | -0.13 |
| 0.02 | -0.13 |
| 0.02 | -0.13 |
| 0.02 | -0.13 |
| 0.02 | -0.13 |
| 0.02 | -0.13 |
| 0.02 | -0.13 |
| 0.02 | -0.13 |
| 0.02 | -0.13 |
| 0.02 | -0.13 |
| 0.02 | -0.13 |
| 0.02 | -0.13 |
| 0.02 | -0.13 |
| 0.02 | -0.13 |
| 0.02 | -0.13 |
| 0.02 | -0.13 |
| 0.02 | -0.13 |
| 0.02 | -0.13 |
| 0.02 | -0.13 |
| 0.02 | -0.13 |
| 0.02 | -0.13 |
| 0.02 | -0.13 |
| 0.02 | -0.13 |
| 0.02 | -0.13 |
| 0.02 | -0.13 |
| 0.02 | -0.13 |
| 0.02 | -0.13 |
| 0.02 | -0.13 |
| 0.02 | -0.13 |
| 0.02 | -0.13 |
| 0.02 | -0.13 |
| 0.02 | -0.13 |
| 0.02 | -0.13 |
| 0.02 | -0.13 |
| 0.02 | -0.13 |
| 0.02 | -0.13 |
| 0.02 | -0.13 |
| 0.02 | -0.13 |
| 0.02 | -0.13 |
| 0.02 | -0.13 |
| 0.02 | -0.13 |
| 0.02 | -0.13 |
| 0.02 | -0.13 |
| 0.02 | -0.13 |
| 0.02 | -0.13 |
| 0.02 | -0.13 |
| 0.02 | -0.13 |
| 0.02 | -0.13 |
| 0.02 | -0.13 |
| 0.02 | -0.13 |
| 0.02 | -0.12 |
| 0.02 | -0.12 |
| 0.02 | -0.12 |
| 0.02 | -0.12 |
| 0.02 | -0.12 |
| 0.02 | -0.12 |
| 0.02 | -0.13 |
| 0.02 | -0.13 |
| 0.02 | -0.13 |
| 0.02 | -0.13 |
| 0.02 | -0.13 |
| 0.02 | -0.13 |
| 0.02 | -0.13 |
| 0.02 | -0.13 |
| 0.02 | -0.13 |
| 0.02 | -0.13 |
| 0.02 | -0.13 |
| 0.02 | -0.13 |
| 0.02 | -0.13 |
| 0.02 | -0.13 |
| 0.02 | -0.13 |
| 0.02 | -0.13 |
| 0.02 | -0.13 |
| 0.02 | -0.13 |
| 0.02 | -0.13 |
| 0.02 | -0.13 |
| 0.02 | -0.13 |
| 0.02 | -0.13 |
| 0.02 | -0.13 |
| 0.02 | -0.13 |
| 0.02 | -0.13 |
| 0.02 | -0.13 |
| 0.02 | -0.13 |
| 0.02 | -0.13 |
| 0.02 | -0.13 |
| 0.02 | -0.13 |
| 0.02 | -0.13 |
| 0.02 | -0.13 |
| 0.02 | -0.13 |
| 0.02 | -0.13 |
| 0.02 | -0.13 |
| 0.02 | -0.13 |
| 0.02 | -0.13 |
| 0.02 | -0.13 |
| 0.02 | -0.13 |
| 0.02 | -0.13 |
| 0.02 | -0.13 |
| 0.02 | -0.13 |
| 0.02 | -0.13 |
| 0.02 | -0.13 |
| 0.02 | -0.13 |
| 0.02 | -0.13 |
| 0.02 | -0.13 |
| 0.02 | -0.13 |
| 0.02 | -0.13 |
| 0.02 | -0.13 |
| 0.02 | -0.13 |
| 0.02 | -0.13 |
| 0.02 | -0.13 |
| 0.02 | -0.13 |
| 0.02 | -0.13 |
| 0.02 | -0.13 |
| 0.02 | -0.13 |
| 0.02 | -0.13 |
| 0.02 | -0.13 |
| 0.02 | -0.13 |
| 0.02 | -0.13 |
| 0.02 | -0.13 |
| 0.02 | -0.13 |
| 0.02 | -0.13 |
| 0.02 | -0.13 |
| 0.02 | -0.13 |
| 0.02 | -0.13 |
| 0.02 | -0.13 |
| 0.02 | -0.13 |
| 0.02 | -0.13 |
| 0.02 | -0.13 |
| 0.02 | -0.13 |
| 0.02 | -0.13 |
| 0.02 | -0.13 |
| 0.02 | -0.13 |
| 0.02 | -0.13 |
| 0.02 | -0.13 |
| 0.02 | -0.13 |
| 0.02 | -0.13 |
| 0.02 | -0.13 |
| 0.02 | -0.13 |
| 0.02 | -0.13 |
| 0.02 | -0.13 |
| 0.02 | -0.13 |
| 0.02 | -0.13 |
| 0.02 | -0.13 |
| 0.02 | -0.13 |
| 0.02 | -0.13 |
| 0.02 | -0.13 |
| 0.02 | -0.13 |
| 0.02 | -0.13 |
| 0.02 | -0.13 |
| 0.02 | -0.13 |
| 0.02 | -0.13 |
| 0.02 | -0.13 |
| 0.02 | -0.13 |
| 0.02 | -0.13 |
| 0.02 | -0.13 |
| 0.02 | -0.13 |
| 0.02 | -0.13 |
| 0.02 | -0.13 |
| 0.02 | -0.13 |
| 0.02 | -0.13 |
| 0.02 | -0.13 |
| 0.02 | -0.13 |
| 0.02 | -0.13 |
| 0.02 | -0.13 |
| 0.02 | -0.13 |
| 0.02 | -0.13 |
| 0.02 | -0.13 |
| 0.02 | -0.13 |
| 0.02 | -0.13 |
| 0.02 | -0.13 |
| 0.02 | -0.13 |
| 0.02 | -0.13 |
| 0.02 | -0.13 |
| 0.02 | -0.13 |
| 0.02 | -0.13 |
| 0.02 | -0.13 |
| 0.02 | -0.13 |
| 0.02 | -0.13 |
| 0.02 | -0.13 |
| 0.02 | -0.13 |
| 0.02 | -0.13 |
| 0.02 | -0.13 |
| 0.02 | -0.13 |
| 0.02 | -0.13 |
| 0.02 | -0.13 |
| 0.02 | -0.13 |
| 0.02 | -0.13 |
| 0.02 | -0.13 |
| 0.02 | -0.13 |
| 0.02 | -0.13 |
| 0.02 | -0.13 |
| 0.02 | -0.13 |
| 0.02 | -0.13 |
| 0.02 | -0.13 |
| 0.02 | -0.13 |
| 0.02 | -0.13 |
| 0.02 | -0.13 |
| 0.02 | -0.13 |
| 0.02 | -0.13 |
| 0.02 | -0.13 |
| 0.02 | -0.13 |
| 0.02 | -0.13 |
| 0.02 | -0.13 |
| 0.02 | -0.13 |
| 0.02 | -0.13 |
| 0.02 | -0.13 |
| 0.02 | -0.13 |
| 0.02 | -0.13 |
| 0.02 | -0.13 |
| 0.02 | -0.13 |
| 0.02 | -0.13 |
| 0.02 | -0.13 |
| 0.02 | -0.13 |
| 0.02 | -0.13 |
| 0.02 | -0.13 |
| 0.02 | -0.13 |
| 0.02 | -0.13 |
| 0.02 | -0.13 |
| 0.02 | -0.13 |
| 0.02 | -0.13 |
| 0.02 | -0.13 |
| 0.02 | -0.13 |
| 0.02 | -0.13 |
| 0.02 | -0.13 |
| 0.02 | -0.13 |
| 0.02 | -0.13 |
| 0.02 | -0.13 |
| 0.02 | -0.13 |
| 0.02 | -0.13 |
| 0.02 | -0.13 |
| 0.02 | -0.13 |
| 0.02 | -0.13 |
| 0.02 | -0.13 |
| 0.02 | -0.13 |
| 0.02 | -0.13 |
| 0.02 | -0.13 |
| 0.02 | -0.13 |
| 0.02 | -0.13 |
| 0.02 | -0.13 |
| 0.02 | -0.13 |
| 0.02 | -0.13 |
| 0.02 | -0.13 |
| 0.02 | -0.13 |
| 0.02 | -0.13 |
| 0.02 | -0.13 |
| 0.02 | -0.13 |
| 0.02 | -0.13 |
| 0.02 | -0.13 |
| 0.02 | -0.13 |
| 0.02 | -0.13 |
| 0.02 | -0.13 |
| 0.02 | -0.13 |
| 0.02 | -0.13 |
| 0.02 | -0.13 |
| 0.02 | -0.13 |
| 0.02 | -0.13 |
| 0.02 | -0.13 |
| 0.02 | -0.13 |
| 0.02 | -0.13 |
| 0.02 | -0.13 |
| 0.02 | -0.13 |
| 0.02 | -0.13 |
| 0.02 | -0.13 |
| 0.02 | -0.13 |
| 0.02 | -0.13 |
| 0.02 | -0.13 |
| 0.02 | -0.13 |
| 0.02 | -0.13 |
| 0.02 | -0.13 |
| 0.02 | -0.13 |
| 0.02 | -0.13 |
| 0.02 | -0.13 |
| 0.02 | -0.13 |
| 0.01 | -0.13 |
| 0.01 | -0.13 |
| 0.01 | -0.13 |
| 0.01 | -0.13 |
| 0.01 | -0.13 |
| 0.01 | -0.13 |
| 0.02 | -0.13 |
| 0.02 | -0.13 |
| 0.02 | -0.13 |
| 0.02 | -0.13 |
| 0.02 | -0.13 |
| 0.02 | -0.13 |
| 0.02 | -0.13 |
| 0.02 | -0.13 |
| 0.02 | -0.13 |
| 0.02 | -0.13 |
| 0.02 | -0.13 |
| 0.02 | -0.13 |
| 0.02 | -0.13 |
| 0.02 | -0.13 |
| 0.02 | -0.13 |
| 0.02 | -0.13 |
| 0.02 | -0.13 |
| 0.02 | -0.13 |
| 0.02 | -0.13 |
| 0.02 | -0.13 |
| 0.02 | -0.13 |
| 0.02 | -0.13 |
| 0.02 | -0.13 |
| 0.02 | -0.13 |
| 0.02 | -0.13 |
| 0.02 | -0.13 |
| 0.02 | -0.13 |
| 0.02 | -0.13 |
| 0.02 | -0.13 |
| 0.02 | -0.13 |
| 0.02 | -0.13 |
| 0.02 | -0.13 |
| 0.02 | -0.13 |
| 0.02 | -0.13 |
| 0.02 | -0.13 |
| 0.02 | -0.13 |
| 0.02 | -0.13 |
| 0.02 | -0.13 |
| 0.02 | -0.13 |
| 0.02 | -0.13 |
| 0.02 | -0.13 |
| 0.02 | -0.13 |
| 0.02 | -0.13 |
| 0.02 | -0.13 |
| 0.02 | -0.13 |
| 0.02 | -0.13 |
| 0.02 | -0.13 |
| 0.02 | -0.13 |
| 0.02 | -0.13 |
| 0.02 | -0.13 |
| 0.02 | -0.13 |
| 0.02 | -0.13 |
| 0.02 | -0.13 |
| 0.02 | -0.13 |
| 0.02 | -0.13 |
| 0.02 | -0.13 |
| 0.02 | -0.13 |
| 0.02 | -0.13 |
| 0.02 | -0.13 |
| 0.02 | -0.13 |
| 0.02 | -0.13 |
| 0.02 | -0.13 |
| 0.02 | -0.13 |
| 0.02 | -0.13 |
| 0.02 | -0.13 |
| 0.02 | -0.13 |
| 0.02 | -0.13 |
| 0.02 | -0.13 |
| 0.02 | -0.13 |
| 0.02 | -0.13 |
| 0.02 | -0.13 |
| 0.02 | -0.13 |
| 0.02 | -0.13 |
| 0.02 | -0.13 |
| 0.02 | -0.13 |
| 0.02 | -0.13 |
| 0.02 | -0.13 |
| 0.02 | -0.13 |
| 0.02 | -0.13 |
| 0.02 | -0.13 |
| 0.02 | -0.13 |
| 0.02 | -0.13 |
| 0.02 | -0.13 |
| 0.02 | -0.13 |
| 0.02 | -0.13 |
| 0.02 | -0.13 |
| 0.02 | -0.13 |
| 0.02 | -0.13 |
| 0.02 | -0.13 |
| 0.02 | -0.13 |
| 0.02 | -0.13 |
| 0.02 | -0.13 |
| 0.02 | -0.13 |
| 0.02 | -0.13 |
| 0.02 | -0.13 |
| 0.02 | -0.13 |
| 0.02 | -0.13 |
| 0.02 | -0.13 |
| 0.02 | -0.13 |
| 0.02 | -0.13 |
| 0.02 | -0.13 |
| 0.02 | -0.13 |
| 0.02 | -0.13 |
| 0.02 | -0.13 |
| 0.02 | -0.13 |
| 0.02 | -0.13 |
| 0.02 | -0.13 |
| 0.02 | -0.13 |
| 0.02 | -0.13 |
| 0.02 | -0.13 |
| 0.02 | -0.13 |
| 0.02 | -0.13 |
| 0.02 | -0.13 |
| 0.02 | -0.13 |
| 0.02 | -0.13 |
| 0.02 | -0.13 |
| 0.02 | -0.13 |
| 0.02 | -0.13 |
| 0.02 | -0.13 |
| 0.02 | -0.13 |
| 0.02 | -0.13 |
| 0.02 | -0.13 |
| 0.02 | -0.13 |
| 0.02 | -0.13 |
| 0.02 | -0.13 |
| 0.02 | -0.13 |
| 0.02 | -0.13 |
| 0.02 | -0.13 |
| 0.02 | -0.13 |
| 0.02 | -0.13 |
| 0.02 | -0.13 |
| 0.02 | -0.13 |
| 0.02 | -0.13 |
| 0.02 | -0.13 |
| 0.02 | -0.13 |
| 0.02 | -0.13 |
| 0.02 | -0.13 |
| 0.02 | -0.13 |
| 0.02 | -0.13 |
| 0.02 | -0.13 |
| 0.02 | -0.13 |
| 0.02 | -0.13 |
| 0.02 | -0.13 |
| 0.02 | -0.13 |
| 0.02 | -0.13 |
| 0.02 | -0.13 |
| 0.02 | -0.13 |
| 0.02 | -0.13 |
| 0.02 | -0.13 |
| 0.02 | -0.13 |
| 0.02 | -0.13 |
| 0.02 | -0.13 |
| 0.02 | -0.13 |
| 0.02 | -0.13 |
| 0.02 | -0.13 |
| 0.02 | -0.13 |
| 0.02 | -0.13 |
| 0.02 | -0.13 |
| 0.02 | -0.13 |
| 0.02 | -0.13 |
| 0.02 | -0.13 |
| 0.02 | -0.13 |
| 0.02 | -0.13 |
| 0.02 | -0.13 |
| 0.02 | -0.13 |
| 0.02 | -0.13 |
| 0.02 | -0.13 |
| 0.02 | -0.13 |
| 0.02 | -0.13 |
| 0.02 | -0.13 |
| 0.02 | -0.13 |
| 0.02 | -0.13 |
| 0.02 | -0.13 |
| 0.02 | -0.13 |
| 0.02 | -0.13 |
| 0.02 | -0.13 |
| 0.02 | -0.13 |
| 0.02 | -0.13 |
| 0.02 | -0.13 |
| 0.02 | -0.13 |
| 0.02 | -0.13 |
| 0.02 | -0.13 |
| 0.02 | -0.13 |
| 0.02 | -0.13 |
| 0.02 | -0.13 |
| 0.02 | -0.13 |
| 0.02 | -0.13 |
| 0.02 | -0.13 |
| 0.02 | -0.13 |
| 0.02 | -0.13 |
| 0.02 | -0.13 |
| 0.02 | -0.13 |
| 0.02 | -0.13 |
| 0.02 | -0.13 |
| 0.02 | -0.13 |
| 0.02 | -0.13 |
| 0.02 | -0.13 |
| 0.02 | -0.13 |
| 0.02 | -0.13 |
| 0.02 | -0.13 |
| 0.02 | -0.13 |
| 0.02 | -0.13 |
| 0.02 | -0.13 |
| 0.02 | -0.13 |
| 0.02 | -0.13 |
| 0.02 | -0.13 |
| 0.02 | -0.13 |
| 0.02 | -0.13 |
| 0.02 | -0.13 |
| 0.02 | -0.13 |
| 0.02 | -0.13 |
| 0.02 | -0.13 |
| 0.02 | -0.13 |
| 0.02 | -0.13 |
| 0.02 | -0.13 |
| 0.02 | -0.13 |
| 0.02 | -0.13 |
| 0.02 | -0.13 |
| 0.02 | -0.13 |
| 0.02 | -0.13 |
| 0.02 | -0.13 |
| 0.02 | -0.13 |
| 0.02 | -0.13 |
| 0.02 | -0.13 |
| 0.02 | -0.13 |
| 0.02 | -0.13 |
| 0.02 | -0.13 |
| 0.02 | -0.13 |
| 0.02 | -0.13 |
| 0.02 | -0.13 |
| 0.02 | -0.13 |
| 0.02 | -0.13 |
| 0.02 | -0.13 |
| 0.02 | -0.13 |
| 0.02 | -0.13 |
| 0.02 | -0.13 |
| 0.02 | -0.13 |
| 0.02 | -0.13 |
| 0.02 | -0.13 |
| 0.02 | -0.13 |
| 0.02 | -0.13 |
| 0.02 | -0.13 |
| 0.02 | -0.13 |
| 0.02 | -0.13 |
| 0.02 | -0.13 |
| 0.02 | -0.13 |
| 0.02 | -0.13 |
| 0.02 | -0.13 |
| 0.02 | -0.13 |
| 0.02 | -0.13 |
| 0.02 | -0.13 |
| 0.02 | -0.13 |
| 0.02 | -0.13 |
| 0.02 | -0.13 |
| 0.02 | -0.13 |
| 0.02 | -0.13 |
| 0.02 | -0.13 |
| 0.02 | -0.13 |
| 0.02 | -0.13 |
| 0.02 | -0.13 |
| 0.02 | -0.13 |
| 0.02 | -0.13 |
| 0.02 | -0.13 |
| 0.02 | -0.13 |
| 0.02 | -0.13 |
| 0.02 | -0.13 |
| 0.02 | -0.13 |
| 0.02 | -0.13 |
| 0.02 | -0.13 |
| 0.02 | -0.13 |
| 0.02 | -0.13 |
| 0.02 | -0.13 |
| 0.02 | -0.13 |
| 0.02 | -0.13 |
| 0.02 | -0.13 |
| 0.02 | -0.13 |
| 0.02 | -0.13 |
| 0.02 | -0.13 |
| 0.02 | -0.13 |
| 0.02 | -0.13 |
| 0.02 | -0.13 |
| 0.02 | -0.13 |
| 0.02 | -0.13 |
| 0.02 | -0.13 |
| 0.02 | -0.13 |
| 0.02 | -0.13 |
| 0.02 | -0.13 |
| 0.02 | -0.13 |
| 0.02 | -0.13 |
| 0.02 | -0.13 |
| 0.02 | -0.13 |
| 0.02 | -0.13 |
| 0.02 | -0.13 |
| 0.02 | -0.13 |
| 0.02 | -0.13 |
| 0.02 | -0.13 |
| 0.02 | -0.13 |
| 0.02 | -0.13 |
| 0.02 | -0.13 |
| 0.02 | -0.13 |
| 0.02 | -0.13 |
| 0.02 | -0.13 |
| 0.02 | -0.13 |
| 0.02 | -0.13 |
| 0.02 | -0.13 |
| 0.02 | -0.13 |
| 0.02 | -0.13 |
| 0.02 | -0.13 |
| 0.02 | -0.13 |
| 0.02 | -0.13 |
| 0.02 | -0.13 |
| 0.02 | -0.13 |
| 0.02 | -0.13 |
| 0.02 | -0.13 |
| 0.02 | -0.13 |
| 0.02 | -0.13 |
| 0.02 | -0.13 |
| 0.02 | -0.13 |
| 0.02 | -0.13 |
| 0.02 | -0.13 |
| 0.02 | -0.13 |
| 0.02 | -0.13 |
| 0.02 | -0.13 |
| 0.02 | -0.13 |
| 0.02 | -0.13 |
| 0.02 | -0.13 |
| 0.02 | -0.13 |
| 0.02 | -0.13 |
| 0.02 | -0.13 |
| 0.02 | -0.13 |
| 0.02 | -0.13 |
| 0.02 | -0.13 |
| 0.02 | -0.13 |
| 0.02 | -0.13 |
| 0.02 | -0.13 |
| 0.02 | -0.13 |
| 0.02 | -0.13 |
| 0.02 | -0.13 |
| 0.02 | -0.13 |
| 0.02 | -0.13 |
| 0.02 | -0.13 |
| 0.02 | -0.13 |
| 0.02 | -0.13 |
| 0.02 | -0.13 |
| 0.02 | -0.13 |
| 0.02 | -0.13 |
| 0.02 | -0.13 |
| 0.02 | -0.13 |
| 0.02 | -0.13 |
| 0.02 | -0.13 |
| 0.02 | -0.13 |
| 0.02 | -0.13 |
| 0.02 | -0.13 |
| 0.02 | -0.13 |
| 0.02 | -0.13 |
| 0.02 | -0.13 |
| 0.02 | -0.13 |
| 0.02 | -0.13 |
| 0.02 | -0.13 |
| 0.02 | -0.13 |
| 0.02 | -0.13 |
| 0.02 | -0.13 |
| 0.02 | -0.13 |
| 0.02 | -0.13 |
| 0.02 | -0.13 |
| 0.02 | -0.13 |
| 0.02 | -0.13 |
| 0.02 | -0.13 |
| 0.02 | -0.13 |
| 0.02 | -0.13 |
| 0.02 | -0.13 |
| 0.02 | -0.13 |
| 0.02 | -0.13 |
| 0.02 | -0.13 |
| 0.02 | -0.13 |
| 0.02 | -0.13 |
| 0.02 | -0.13 |
| 0.02 | -0.13 |
| 0.02 | -0.13 |
| 0.02 | -0.13 |
| 0.02 | -0.13 |
| 0.02 | -0.13 |
| 0.02 | -0.13 |
| 0.02 | -0.13 |
| 0.01 | -0.13 |
| 0.01 | -0.13 |
| 0.01 | -0.13 |
| 0.01 | -0.13 |
| 0.01 | -0.13 |
| 0.01 | -0.13 |
| 0.01 | -0.13 |
| 0.01 | -0.13 |
| 0.01 | -0.13 |
| 0.01 | -0.13 |
| 0.01 | -0.13 |
| 0.01 | -0.13 |
| 0.02 | -0.13 |
| 0.02 | -0.13 |
| 0.02 | -0.13 |
| 0.02 | -0.13 |
| 0.02 | -0.13 |
| 0.02 | -0.13 |
| 0.02 | -0.13 |
| 0.02 | -0.13 |
| 0.02 | -0.13 |
| 0.02 | -0.13 |
| 0.02 | -0.13 |
| 0.02 | -0.13 |
| 0.02 | -0.13 |
| 0.02 | -0.13 |
| 0.02 | -0.13 |
| 0.02 | -0.13 |
| 0.02 | -0.13 |
| 0.02 | -0.13 |
| 0.02 | -0.13 |
| 0.02 | -0.13 |
| 0.02 | -0.13 |
| 0.02 | -0.13 |
| 0.02 | -0.13 |
| 0.02 | -0.13 |
| 0.02 | -0.13 |
| 0.02 | -0.13 |
| 0.02 | -0.13 |
| 0.02 | -0.13 |
| 0.02 | -0.13 |
| 0.02 | -0.13 |
| 0.02 | -0.13 |
| 0.02 | -0.13 |
| 0.02 | -0.13 |
| 0.02 | -0.13 |
| 0.02 | -0.13 |
| 0.02 | -0.13 |
| 0.02 | -0.13 |
| 0.02 | -0.13 |
| 0.02 | -0.13 |
| 0.02 | -0.13 |
| 0.02 | -0.13 |
| 0.02 | -0.13 |
| 0.02 | -0.13 |
| 0.02 | -0.13 |
| 0.02 | -0.13 |
| 0.02 | -0.13 |
| 0.02 | -0.13 |
| 0.02 | -0.13 |
| 0.02 | -0.13 |
| 0.02 | -0.13 |
| 0.02 | -0.13 |
| 0.02 | -0.13 |
| 0.02 | -0.13 |
| 0.02 | -0.13 |
| 0.02 | -0.13 |
| 0.02 | -0.13 |
| 0.02 | -0.13 |
| 0.02 | -0.13 |
| 0.02 | -0.13 |
| 0.02 | -0.13 |
| 0.02 | -0.13 |
| 0.02 | -0.13 |
| 0.02 | -0.13 |
| 0.02 | -0.13 |
| 0.02 | -0.13 |
| 0.02 | -0.13 |
| 0.02 | -0.13 |
| 0.02 | -0.13 |
| 0.02 | -0.13 |
| 0.02 | -0.13 |
| 0.02 | -0.13 |
| 0.02 | -0.13 |
| 0.02 | -0.13 |
| 0.02 | -0.13 |
| 0.02 | -0.13 |
| 0.02 | -0.13 |
| 0.02 | -0.13 |
| 0.02 | -0.13 |
| 0.02 | -0.13 |
| 0.02 | -0.13 |
| 0.02 | -0.13 |
| 0.02 | -0.13 |
| 0.02 | -0.13 |
| 0.02 | -0.13 |
| 0.02 | -0.13 |
| 0.02 | -0.13 |
| 0.02 | -0.13 |
| 0.02 | -0.13 |
| 0.02 | -0.13 |
| 0.02 | -0.13 |
| 0.02 | -0.13 |
| 0.02 | -0.13 |
| 0.02 | -0.13 |
| 0.02 | -0.13 |
| 0.02 | -0.13 |
| 0.02 | -0.13 |
| 0.02 | -0.13 |
| 0.02 | -0.13 |
| 0.02 | -0.13 |
| 0.02 | -0.13 |
| 0.02 | -0.13 |
| 0.02 | -0.13 |
| 0.02 | -0.13 |
| 0.02 | -0.13 |
| 0.02 | -0.13 |
| 0.02 | -0.13 |
| 0.02 | -0.13 |
| 0.02 | -0.13 |
| 0.02 | -0.13 |
| 0.02 | -0.13 |
| 0.02 | -0.13 |
| 0.02 | -0.13 |
| 0.02 | -0.13 |
| 0.02 | -0.13 |
| 0.02 | -0.13 |
| 0.02 | -0.13 |
| 0.02 | -0.13 |
| 0.02 | -0.13 |
| 0.02 | -0.13 |
| 0.02 | -0.13 |
| 0.02 | -0.13 |
| 0.02 | -0.13 |
| 0.02 | -0.13 |
| 0.02 | -0.13 |
| 0.02 | -0.13 |
| 0.02 | -0.13 |
| 0.02 | -0.13 |
| 0.02 | -0.13 |
| 0.02 | -0.13 |
| 0.02 | -0.13 |
| 0.02 | -0.13 |
| 0.02 | -0.13 |
| 0.02 | -0.13 |
| 0.02 | -0.13 |
| 0.02 | -0.13 |
| 0.02 | -0.13 |
| 0.02 | -0.13 |
| 0.02 | -0.13 |
| 0.02 | -0.13 |
| 0.02 | -0.13 |
| 0.02 | -0.13 |
| 0.02 | -0.13 |
| 0.02 | -0.13 |
| 0.02 | -0.13 |
| 0.02 | -0.13 |
| 0.02 | -0.13 |
| 0.02 | -0.13 |
| 0.02 | -0.13 |
| 0.02 | -0.13 |
| 0.02 | -0.13 |
| 0.02 | -0.13 |
| 0.02 | -0.13 |
| 0.02 | -0.13 |
| 0.02 | -0.13 |
| 0.02 | -0.13 |
| 0.02 | -0.13 |
| 0.02 | -0.13 |
| 0.02 | -0.13 |
| 0.02 | -0.13 |
| 0.02 | -0.13 |
| 0.02 | -0.13 |
| 0.02 | -0.13 |
| 0.02 | -0.13 |
| 0.02 | -0.13 |
| 0.02 | -0.13 |
| 0.02 | -0.13 |
| 0.02 | -0.13 |
| 0.02 | -0.13 |
| 0.02 | -0.13 |
| 0.02 | -0.13 |
| 0.02 | -0.13 |
| 0.02 | -0.13 |
| 0.02 | -0.13 |
| 0.02 | -0.13 |
| 0.02 | -0.13 |
| 0.02 | -0.13 |
| 0.02 | -0.13 |
| 0.02 | -0.13 |
| 0.02 | -0.13 |
| 0.02 | -0.13 |
| 0.01 | -0.13 |
| 0.01 | -0.13 |
| 0.01 | -0.13 |
| 0.01 | -0.13 |
| 0.01 | -0.13 |
| 0.01 | -0.13 |
| 0.02 | -0.13 |
| 0.02 | -0.13 |
| 0.02 | -0.13 |
| 0.02 | -0.13 |
| 0.02 | -0.13 |
| 0.02 | -0.13 |
| 0.02 | -0.13 |
| 0.02 | -0.13 |
| 0.02 | -0.13 |
| 0.02 | -0.13 |
| 0.02 | -0.13 |
| 0.02 | -0.13 |
| 0.02 | -0.13 |
| 0.02 | -0.13 |
| 0.02 | -0.13 |
| 0.02 | -0.13 |
| 0.02 | -0.13 |
| 0.02 | -0.13 |
| 0.02 | -0.13 |
| 0.02 | -0.13 |
| 0.02 | -0.13 |
| 0.02 | -0.13 |
| 0.02 | -0.13 |
| 0.02 | -0.13 |
| 0.02 | -0.13 |
| 0.02 | -0.13 |
| 0.02 | -0.13 |
| 0.02 | -0.13 |
| 0.02 | -0.13 |
| 0.02 | -0.13 |
| 0.02 | -0.13 |
| 0.02 | -0.13 |
| 0.02 | -0.13 |
| 0.02 | -0.13 |
| 0.02 | -0.13 |
| 0.02 | -0.13 |
| 0.02 | -0.13 |
| 0.02 | -0.13 |
| 0.02 | -0.13 |
| 0.02 | -0.13 |
| 0.02 | -0.13 |
| 0.02 | -0.13 |
| 0.02 | -0.13 |
| 0.02 | -0.13 |
| 0.02 | -0.13 |
| 0.02 | -0.13 |
| 0.02 | -0.13 |
| 0.02 | -0.13 |
| 0.02 | -0.13 |
| 0.02 | -0.13 |
| 0.02 | -0.13 |
| 0.02 | -0.13 |
| 0.02 | -0.13 |
| 0.02 | -0.13 |
| 0.02 | -0.13 |
| 0.02 | -0.13 |
| 0.02 | -0.13 |
| 0.02 | -0.13 |
| 0.02 | -0.13 |
| 0.02 | -0.13 |
| 0.02 | -0.13 |
| 0.02 | -0.13 |
| 0.02 | -0.13 |
| 0.02 | -0.13 |
| 0.02 | -0.13 |
| 0.02 | -0.13 |
| 0.02 | -0.13 |
| 0.02 | -0.13 |
| 0.02 | -0.13 |
| 0.02 | -0.13 |
| 0.02 | -0.13 |
| 0.02 | -0.13 |
| 0.02 | -0.13 |
| 0.02 | -0.13 |
| 0.02 | -0.13 |
| 0.02 | -0.13 |
| 0.02 | -0.13 |
| 0.02 | -0.13 |
| 0.02 | -0.13 |
| 0.02 | -0.13 |
| 0.02 | -0.13 |
| 0.02 | -0.13 |
| 0.02 | -0.13 |
| 0.02 | -0.13 |
| 0.02 | -0.13 |
| 0.02 | -0.13 |
| 0.02 | -0.13 |
| 0.02 | -0.13 |
| 0.02 | -0.13 |
| 0.02 | -0.13 |
| 0.02 | -0.13 |
| 0.02 | -0.13 |
| 0.02 | -0.13 |
| 0.02 | -0.13 |
| 0.02 | -0.13 |
| 0.02 | -0.13 |
| 0.02 | -0.13 |
| 0.02 | -0.13 |
| 0.02 | -0.13 |
| 0.02 | -0.13 |
| 0.02 | -0.13 |
| 0.02 | -0.13 |
| 0.02 | -0.13 |
| 0.02 | -0.13 |
| 0.02 | -0.13 |
| 0.02 | -0.13 |
| 0.02 | -0.13 |
| 0.02 | -0.13 |
| 0.02 | -0.13 |
| 0.02 | -0.13 |
| 0.02 | -0.13 |
| 0.02 | -0.13 |
| 0.02 | -0.13 |
| 0.02 | -0.13 |
| 0.02 | -0.13 |
| 0.02 | -0.13 |
| 0.02 | -0.13 |
| 0.02 | -0.13 |
| 0.02 | -0.13 |
| 0.02 | -0.13 |
| 0.02 | -0.13 |
| 0.02 | -0.13 |
| 0.02 | -0.13 |
| 0.02 | -0.13 |
| 0.02 | -0.13 |
| 0.02 | -0.13 |
| 0.02 | -0.13 |
| 0.02 | -0.13 |
| 0.02 | -0.13 |
| 0.02 | -0.13 |
| 0.02 | -0.13 |
| 0.02 | -0.13 |
| 0.02 | -0.13 |
| 0.02 | -0.13 |
| 0.02 | -0.13 |
| 0.02 | -0.13 |
| 0.02 | -0.13 |
| 0.02 | -0.13 |
| 0.02 | -0.13 |
| 0.02 | -0.13 |
| 0.02 | -0.13 |
| 0.02 | -0.13 |
| 0.02 | -0.13 |
| 0.02 | -0.13 |
| 0.02 | -0.13 |
| 0.02 | -0.13 |
| 0.02 | -0.13 |
| 0.02 | -0.13 |
| 0.02 | -0.13 |
| 0.02 | -0.13 |
| 0.02 | -0.13 |
| 0.02 | -0.13 |
| 0.02 | -0.13 |
| 0.02 | -0.13 |
| 0.02 | -0.13 |
| 0.02 | -0.13 |
| 0.02 | -0.13 |
| 0.02 | -0.13 |
| 0.02 | -0.13 |
| 0.02 | -0.13 |
| 0.02 | -0.13 |
| 0.02 | -0.13 |
| 0.02 | -0.13 |
| 0.02 | -0.13 |
| 0.02 | -0.13 |
| 0.02 | -0.13 |
| 0.02 | -0.13 |
| 0.02 | -0.13 |
| 0.02 | -0.13 |
| 0.02 | -0.13 |
| 0.02 | -0.13 |
| 0.02 | -0.13 |
| 0.02 | -0.13 |
| 0.02 | -0.13 |
| 0.02 | -0.13 |
| 0.02 | -0.13 |
| 0.02 | -0.13 |
| 0.02 | -0.13 |
| 0.02 | -0.13 |
| 0.02 | -0.13 |
| 0.02 | -0.13 |
| 0.02 | -0.13 |
| 0.02 | -0.13 |
| 0.02 | -0.13 |
| 0.02 | -0.13 |
| 0.02 | -0.13 |
| 0.02 | -0.13 |
| 0.02 | -0.13 |
| 0.02 | -0.13 |
| 0.02 | -0.13 |
| 0.02 | -0.13 |
| 0.02 | -0.13 |
| 0.02 | -0.13 |
| 0.02 | -0.13 |
| 0.02 | -0.13 |
| 0.02 | -0.13 |
| 0.02 | -0.13 |
| 0.02 | -0.13 |
| 0.02 | -0.13 |
| 0.02 | -0.13 |
| 0.02 | -0.13 |
| 0.02 | -0.13 |
| 0.02 | -0.13 |
| 0.02 | -0.13 |
| 0.02 | -0.13 |
| 0.02 | -0.13 |
| 0.02 | -0.13 |
| 0.02 | -0.13 |
| 0.02 | -0.13 |
| 0.02 | -0.13 |
| 0.02 | -0.13 |
| 0.02 | -0.13 |
| 0.02 | -0.13 |
| 0.02 | -0.13 |
| 0.02 | -0.13 |
| 0.02 | -0.13 |
| 0.02 | -0.13 |
| 0.02 | -0.13 |
| 0.02 | -0.13 |
| 0.02 | -0.13 |
| 0.02 | -0.13 |
| 0.02 | -0.13 |
| 0.02 | -0.13 |
| 0.02 | -0.13 |
| 0.02 | -0.13 |
| 0.02 | -0.13 |
| 0.02 | -0.13 |
| 0.02 | -0.13 |
| 0.02 | -0.13 |
| 0.02 | -0.13 |
| 0.02 | -0.13 |
| 0.02 | -0.13 |
| 0.02 | -0.13 |
| 0.02 | -0.13 |
| 0.02 | -0.13 |
| 0.02 | -0.13 |
| 0.02 | -0.13 |
| 0.02 | -0.13 |
| 0.02 | -0.13 |
| 0.02 | -0.13 |
| 0.02 | -0.13 |
| 0.02 | -0.13 |
| 0.02 | -0.13 |
| 0.02 | -0.13 |
| 0.02 | -0.13 |
| 0.02 | -0.13 |
| 0.02 | -0.13 |
| 0.02 | -0.13 |
| 0.02 | -0.13 |
| 0.02 | -0.13 |
| 0.02 | -0.13 |
| 0.02 | -0.13 |
| 0.02 | -0.13 |
| 0.02 | -0.13 |
| 0.02 | -0.13 |
| 0.02 | -0.13 |
| 0.02 | -0.13 |
| 0.02 | -0.13 |
| 0.02 | -0.13 |
| 0.02 | -0.13 |
| 0.02 | -0.13 |
| 0.02 | -0.13 |
| 0.02 | -0.13 |
| 0.02 | -0.13 |
| 0.02 | -0.13 |
| 0.02 | -0.13 |
| 0.02 | -0.13 |
| 0.02 | -0.13 |
| 0.02 | -0.13 |
| 0.02 | -0.13 |
| 0.02 | -0.13 |
| 0.02 | -0.13 |
| 0.02 | -0.13 |
| 0.02 | -0.13 |
| 0.02 | -0.13 |
| 0.02 | -0.13 |
| 0.02 | -0.13 |
| 0.02 | -0.13 |
| 0.02 | -0.13 |
| 0.02 | -0.13 |
| 0.02 | -0.13 |
| 0.02 | -0.13 |
| 0.02 | -0.13 |
| 0.02 | -0.13 |
| 0.02 | -0.13 |
| 0.02 | -0.13 |
| 0.02 | -0.13 |
| 0.02 | -0.13 |
| 0.02 | -0.13 |
| 0.02 | -0.13 |
| 0.02 | -0.13 |
| 0.02 | -0.13 |
| 0.02 | -0.13 |
| 0.02 | -0.13 |
| 0.02 | -0.13 |
| 0.02 | -0.13 |
| 0.02 | -0.13 |
| 0.02 | -0.13 |
| 0.02 | -0.13 |
| 0.02 | -0.13 |
| 0.02 | -0.13 |
| 0.02 | -0.13 |
| 0.02 | -0.13 |
| 0.02 | -0.13 |
| 0.02 | -0.13 |
| 0.02 | -0.13 |
| 0.02 | -0.13 |
| 0.02 | -0.13 |
| 0.02 | -0.13 |
| 0.02 | -0.13 |
| 0.02 | -0.13 |
| 0.02 | -0.13 |
| 0.02 | -0.13 |
| 0.02 | -0.13 |
| 0.02 | -0.13 |
| 0.02 | -0.13 |
| 0.02 | -0.13 |
| 0.02 | -0.13 |
| 0.02 | -0.13 |
| 0.02 | -0.13 |
| 0.02 | -0.13 |
| 0.02 | -0.13 |
| 0.02 | -0.13 |
| 0.02 | -0.13 |
| 0.02 | -0.13 |
| 0.02 | -0.13 |
| 0.02 | -0.13 |
| 0.02 | -0.13 |
| 0.02 | -0.13 |
| 0.02 | -0.13 |
| 0.02 | -0.13 |
| 0.02 | -0.13 |
| 0.02 | -0.13 |
| 0.02 | -0.13 |
| 0.02 | -0.13 |
| 0.02 | -0.13 |
| 0.02 | -0.13 |
| 0.02 | -0.13 |
| 0.02 | -0.13 |
| 0.02 | -0.13 |
| 0.02 | -0.13 |
| 0.02 | -0.13 |
| 0.02 | -0.13 |
| 0.02 | -0.13 |
| 0.02 | -0.13 |
| 0.02 | -0.13 |
| 0.02 | -0.13 |
| 0.02 | -0.13 |
| 0.02 | -0.13 |
| 0.02 | -0.13 |
| 0.02 | -0.13 |
| 0.02 | -0.13 |
| 0.02 | -0.13 |
| 0.02 | -0.13 |
| 0.02 | -0.13 |
| 0.02 | -0.13 |
| 0.02 | -0.13 |
| 0.02 | -0.13 |
| 0.02 | -0.13 |
| 0.02 | -0.13 |
| 0.02 | -0.13 |
| 0.02 | -0.13 |
| 0.02 | -0.13 |
| 0.02 | -0.13 |
| 0.02 | -0.13 |
| 0.02 | -0.13 |
| 0.02 | -0.13 |
| 0.02 | -0.13 |
| 0.02 | -0.13 |
| 0.02 | -0.13 |
| 0.02 | -0.13 |
| 0.02 | -0.13 |
| 0.02 | -0.13 |
| 0.02 | -0.13 |
| 0.02 | -0.13 |
| 0.02 | -0.13 |
| 0.02 | -0.13 |
| 0.02 | -0.13 |
| 0.02 | -0.13 |
| 0.02 | -0.13 |
| 0.02 | -0.13 |
| 0.02 | -0.13 |
| 0.02 | -0.13 |
| 0.02 | -0.13 |
| 0.02 | -0.13 |
| 0.02 | -0.13 |
| 0.02 | -0.13 |
| 0.02 | -0.13 |
| 0.02 | -0.13 |
| 0.02 | -0.13 |
| 0.02 | -0.13 |
| 0.02 | -0.13 |
| 0.02 | -0.13 |
| 0.02 | -0.13 |
| 0.02 | -0.13 |
| 0.02 | -0.13 |
| 0.02 | -0.13 |
| 0.02 | -0.13 |
| 0.02 | -0.13 |
| 0.02 | -0.13 |
| 0.02 | -0.13 |
| 0.02 | -0.13 |
| 0.02 | -0.13 |
| 0.02 | -0.13 |
| 0.02 | -0.13 |
| 0.02 | -0.13 |
| 0.02 | -0.13 |
| 0.02 | -0.13 |
| 0.02 | -0.13 |
| 0.02 | -0.13 |
| 0.02 | -0.13 |
| 0.02 | -0.13 |
| 0.02 | -0.13 |
| 0.02 | -0.13 |
| 0.02 | -0.13 |
| 0.02 | -0.13 |
| 0.02 | -0.13 |
| 0.02 | -0.13 |
| 0.02 | -0.13 |
| 0.02 | -0.13 |
| 0.02 | -0.13 |
| 0.02 | -0.13 |
| 0.02 | -0.13 |
| 0.02 | -0.13 |
| 0.02 | -0.13 |
| 0.02 | -0.13 |
| 0.02 | -0.13 |
| 0.02 | -0.13 |
| 0.02 | -0.13 |
| 0.02 | -0.13 |
| 0.02 | -0.13 |
| 0.02 | -0.13 |
| 0.02 | -0.13 |
| 0.02 | -0.13 |
| 0.02 | -0.13 |
| 0.02 | -0.13 |
| 0.02 | -0.13 |
| 0.02 | -0.13 |
| 0.02 | -0.13 |
| 0.02 | -0.13 |
| 0.02 | -0.13 |
| 0.02 | -0.13 |
| 0.02 | -0.13 |
| 0.02 | -0.13 |
| 0.02 | -0.13 |
| 0.02 | -0.13 |
| 0.02 | -0.13 |
| 0.02 | -0.13 |
| 0.02 | -0.13 |
| 0.02 | -0.13 |
| 0.02 | -0.13 |
| 0.02 | -0.13 |
| 0.02 | -0.13 |
| 0.02 | -0.13 |
| 0.02 | -0.13 |
| 0.02 | -0.13 |
| 0.02 | -0.13 |
| 0.02 | -0.13 |
| 0.02 | -0.13 |
| 0.02 | -0.13 |
| 0.02 | -0.13 |
| 0.02 | -0.13 |
| 0.02 | -0.13 |
| 0.02 | -0.13 |
| 0.02 | -0.13 |
| 0.02 | -0.13 |
| 0.02 | -0.13 |
| 0.02 | -0.13 |
| 0.02 | -0.13 |
| 0.02 | -0.13 |
| 0.02 | -0.13 |
| 0.02 | -0.13 |
| 0.02 | -0.13 |
| 0.02 | -0.13 |
| 0.02 | -0.13 |
| 0.02 | -0.13 |
| 0.02 | -0.13 |
| 0.02 | -0.13 |
| 0.02 | -0.13 |
| 0.02 | -0.13 |
| 0.02 | -0.13 |
| 0.02 | -0.13 |
| 0.02 | -0.13 |
| 0.02 | -0.13 |
| 0.02 | -0.13 |
| 0.02 | -0.13 |
| 0.02 | -0.13 |
| 0.02 | -0.13 |
| 0.02 | -0.13 |
| 0.02 | -0.13 |
| 0.02 | -0.13 |
| 0.02 | -0.13 |
| 0.02 | -0.13 |
| 0.02 | -0.13 |
| 0.02 | -0.13 |
| 0.02 | -0.13 |
| 0.02 | -0.13 |
| 0.02 | -0.13 |
| 0.02 | -0.13 |
| 0.02 | -0.13 |
| 0.02 | -0.13 |
| 0.02 | -0.13 |
| 0.02 | -0.13 |
| 0.02 | -0.13 |
| 0.02 | -0.13 |
| 0.02 | -0.13 |
| 0.02 | -0.13 |
| 0.02 | -0.13 |
| 0.02 | -0.13 |
| 0.02 | -0.13 |
| 0.02 | -0.13 |
| 0.02 | -0.13 |
| 0.02 | -0.13 |
| 0.02 | -0.13 |
| 0.02 | -0.13 |
| 0.02 | -0.13 |
| 0.02 | -0.13 |
| 0.02 | -0.13 |
| 0.02 | -0.13 |
| 0.02 | -0.13 |
| 0.02 | -0.13 |
| 0.02 | -0.13 |
| 0.02 | -0.13 |
| 0.02 | -0.13 |
| 0.02 | -0.13 |
| 0.02 | -0.13 |
| 0.02 | -0.13 |
| 0.02 | -0.13 |
| 0.02 | -0.13 |
| 0.02 | -0.13 |
| 0.02 | -0.13 |
| 0.02 | -0.13 |
| 0.02 | -0.13 |
| 0.02 | -0.13 |
| 0.02 | -0.13 |
| 0.02 | -0.13 |
| 0.02 | -0.13 |
| 0.02 | -0.13 |
| 0.02 | -0.13 |
| 0.02 | -0.13 |
| 0.02 | -0.13 |
| 0.02 | -0.13 |
| 0.02 | -0.13 |
| 0.02 | -0.13 |
| 0.02 | -0.13 |
| 0.02 | -0.13 |
| 0.02 | -0.13 |
| 0.02 | -0.13 |
| 0.02 | -0.13 |
| 0.02 | -0.13 |
| 0.02 | -0.13 |
| 0.02 | -0.13 |
| 0.02 | -0.13 |
| 0.02 | -0.13 |
| 0.02 | -0.13 |
| 0.02 | -0.13 |
| 0.02 | -0.13 |
| 0.02 | -0.13 |
| 0.02 | -0.13 |
| 0.02 | -0.13 |
| 0.02 | -0.13 |
| 0.02 | -0.13 |
| 0.02 | -0.13 |
| 0.02 | -0.13 |
| 0.02 | -0.13 |
| 0.02 | -0.13 |
| 0.02 | -0.13 |
| 0.02 | -0.13 |
| 0.02 | -0.13 |
| 0.02 | -0.13 |
| 0.02 | -0.13 |
| 0.02 | -0.13 |
| 0.02 | -0.13 |
| 0.02 | -0.13 |
| 0.02 | -0.13 |
| 0.02 | -0.13 |
| 0.02 | -0.13 |
| 0.02 | -0.13 |
| 0.02 | -0.13 |
| 0.02 | -0.13 |
| 0.02 | -0.13 |
| 0.02 | -0.13 |
| 0.02 | -0.13 |
| 0.02 | -0.13 |
| 0.02 | -0.13 |
| 0.02 | -0.13 |
| 0.02 | -0.13 |
| 0.02 | -0.13 |
| 0.02 | -0.13 |
| 0.02 | -0.13 |
| 0.02 | -0.13 |
| 0.02 | -0.13 |
| 0.02 | -0.13 |
| 0.02 | -0.13 |
| 0.02 | -0.13 |
| 0.02 | -0.13 |
| 0.02 | -0.13 |
| 0.02 | -0.13 |
| 0.02 | -0.13 |
| 0.02 | -0.13 |
| 0.02 | -0.13 |
| 0.02 | -0.13 |
| 0.02 | -0.13 |
| 0.02 | -0.13 |
| 0.02 | -0.13 |
| 0.02 | -0.13 |
| 0.02 | -0.13 |
| 0.02 | -0.13 |
| 0.02 | -0.13 |
| 0.02 | -0.13 |
| 0.02 | -0.13 |
| 0.02 | -0.13 |
| 0.02 | -0.13 |
| 0.02 | -0.13 |
| 0.02 | -0.13 |
| 0.02 | -0.13 |
| 0.02 | -0.13 |
| 0.02 | -0.13 |
| 0.02 | -0.13 |
| 0.02 | -0.13 |
| 0.02 | -0.13 |
| 0.02 | -0.13 |
| 0.02 | -0.13 |
| 0.02 | -0.13 |
| 0.02 | -0.13 |
| 0.02 | -0.13 |
| 0.02 | -0.13 |
| 0.02 | -0.13 |
| 0.02 | -0.13 |
| 0.02 | -0.13 |
| 0.02 | -0.13 |
| 0.02 | -0.13 |
| 0.02 | -0.13 |
| 0.02 | -0.13 |
| 0.02 | -0.13 |
| 0.02 | -0.13 |
| 0.02 | -0.13 |
| 0.02 | -0.13 |
| 0.02 | -0.13 |
| 0.02 | -0.13 |
| 0.02 | -0.13 |
| 0.02 | -0.13 |
| 0.02 | -0.13 |
| 0.02 | -0.13 |
| 0.02 | -0.13 |
| 0.02 | -0.13 |
| 0.02 | -0.13 |
| 0.02 | -0.13 |
| 0.02 | -0.13 |
| 0.02 | -0.13 |
| 0.02 | -0.13 |
| 0.02 | -0.13 |
| 0.02 | -0.13 |
| 0.02 | -0.13 |
| 0.02 | -0.13 |
| 0.02 | -0.13 |
| 0.02 | -0.13 |
| 0.02 | -0.13 |
| 0.02 | -0.13 |
| 0.02 | -0.13 |
| 0.02 | -0.13 |
| 0.02 | -0.13 |
| 0.02 | -0.13 |
| 0.02 | -0.13 |
| 0.02 | -0.13 |
| 0.02 | -0.13 |
| 0.02 | -0.13 |
| 0.02 | -0.13 |
| 0.02 | -0.13 |
| 0.02 | -0.13 |
| 0.02 | -0.13 |
| 0.02 | -0.13 |
| 0.02 | -0.13 |
| 0.02 | -0.13 |
| 0.02 | -0.13 |
| 0.02 | -0.13 |
| 0.02 | -0.13 |
| 0.02 | -0.13 |
| 0.02 | -0.13 |
| 0.02 | -0.13 |
| 0.02 | -0.13 |
| 0.02 | -0.13 |
| 0.02 | -0.13 |
| 0.02 | -0.13 |
| 0.02 | -0.13 |
| 0.02 | -0.13 |
| 0.02 | -0.13 |
| 0.02 | -0.13 |
| 0.02 | -0.13 |
| 0.02 | -0.13 |
| 0.02 | -0.13 |
| 0.02 | -0.13 |
| 0.02 | -0.13 |
| 0.02 | -0.13 |
| 0.02 | -0.13 |
| 0.02 | -0.13 |
| 0.02 | -0.13 |
| 0.02 | -0.13 |
| 0.02 | -0.13 |
| 0.02 | -0.13 |
| 0.02 | -0.13 |
| 0.02 | -0.13 |
| 0.02 | -0.13 |
| 0.02 | -0.13 |
| 0.02 | -0.13 |
| 0.02 | -0.13 |
| 0.02 | -0.13 |
| 0.02 | -0.13 |
| 0.02 | -0.13 |
| 0.02 | -0.13 |
| 0.02 | -0.13 |
| 0.02 | -0.13 |
| 0.02 | -0.13 |
| 0.02 | -0.13 |
| 0.02 | -0.13 |
| 0.02 | -0.13 |
| 0.02 | -0.13 |
| 0.02 | -0.13 |
| 0.02 | -0.13 |
| 0.02 | -0.13 |
| 0.02 | -0.13 |
| 0.02 | -0.13 |
| 0.02 | -0.13 |
| 0.02 | -0.13 |
| 0.02 | -0.13 |
| 0.02 | -0.13 |
| 0.02 | -0.13 |
| 0.02 | -0.13 |
| 0.02 | -0.13 |
| 0.02 | -0.13 |
| 0.02 | -0.13 |
| 0.02 | -0.13 |
| 0.02 | -0.13 |
| 0.02 | -0.13 |
| 0.02 | -0.13 |
| 0.02 | -0.13 |
| 0.02 | -0.13 |
| 0.02 | -0.13 |
| 0.02 | -0.13 |
| 0.02 | -0.13 |
| 0.02 | -0.13 |
| 0.02 | -0.13 |
| 0.02 | -0.13 |
| 0.02 | -0.13 |
| 0.02 | -0.13 |
| 0.02 | -0.13 |
| 0.02 | -0.13 |
| 0.02 | -0.13 |
| 0.02 | -0.13 |
| 0.02 | -0.13 |
| 0.02 | -0.13 |
| 0.02 | -0.13 |
| 0.02 | -0.13 |
| 0.02 | -0.13 |
| 0.02 | -0.13 |
| 0.02 | -0.13 |
| 0.02 | -0.13 |
| 0.02 | -0.13 |
| 0.02 | -0.13 |
| 0.02 | -0.13 |
| 0.02 | -0.13 |
| 0.02 | -0.13 |
| 0.02 | -0.13 |
| 0.02 | -0.13 |
| 0.02 | -0.13 |
| 0.02 | -0.13 |
| 0.02 | -0.13 |
| 0.02 | -0.13 |
| 0.02 | -0.13 |
| 0.02 | -0.13 |
| 0.02 | -0.13 |
| 0.02 | -0.13 |
| 0.02 | -0.13 |
| 0.02 | -0.13 |
| 0.02 | -0.13 |
| 0.02 | -0.13 |
| 0.02 | -0.13 |
| 0.02 | -0.13 |
| 0.02 | -0.13 |
| 0.02 | -0.13 |
| 0.02 | -0.13 |
| 0.02 | -0.13 |
| 0.02 | -0.13 |
| 0.02 | -0.13 |
| 0.02 | -0.13 |
| 0.02 | -0.13 |
| 0.02 | -0.13 |
| 0.02 | -0.13 |
| 0.02 | -0.13 |
| 0.02 | -0.13 |
| 0.02 | -0.13 |
| 0.02 | -0.13 |
| 0.02 | -0.13 |
| 0.02 | -0.13 |
| 0.02 | -0.13 |
| 0.02 | -0.13 |
| 0.02 | -0.13 |
| 0.02 | -0.13 |
| 0.02 | -0.13 |
| 0.02 | -0.13 |
| 0.02 | -0.13 |
| 0.02 | -0.13 |
| 0.02 | -0.13 |
| 0.02 | -0.13 |
| 0.02 | -0.13 |
| 0.02 | -0.13 |
| 0.02 | -0.13 |
| 0.02 | -0.13 |
| 0.02 | -0.13 |
| 0.02 | -0.13 |
| 0.02 | -0.13 |
| 0.02 | -0.13 |
| 0.02 | -0.13 |
| 0.02 | -0.13 |
| 0.02 | -0.13 |
| 0.02 | -0.13 |
| 0.02 | -0.13 |
| 0.02 | -0.13 |
| 0.02 | -0.13 |
| 0.02 | -0.13 |
| 0.02 | -0.13 |
| 0.02 | -0.13 |
| 0.01 | -0.13 |
| 0.01 | -0.13 |
| 0.01 | -0.13 |
| 0.01 | -0.13 |
| 0.01 | -0.13 |
| 0.01 | -0.13 |
| 0.02 | -0.13 |
| 0.02 | -0.13 |
| 0.02 | -0.13 |
| 0.02 | -0.13 |
| 0.02 | -0.13 |
| 0.02 | -0.13 |
| 0.02 | -0.13 |
| 0.02 | -0.13 |
| 0.02 | -0.13 |
| 0.02 | -0.13 |
| 0.02 | -0.13 |
| 0.02 | -0.13 |
| 0.02 | -0.13 |
| 0.02 | -0.13 |
| 0.02 | -0.13 |
| 0.02 | -0.13 |
| 0.02 | -0.13 |
| 0.02 | -0.13 |
| 0.02 | -0.13 |
| 0.02 | -0.13 |
| 0.02 | -0.13 |
| 0.02 | -0.13 |
| 0.02 | -0.13 |
| 0.02 | -0.13 |
| 0.02 | -0.13 |
| 0.02 | -0.13 |
| 0.02 | -0.13 |
| 0.02 | -0.13 |
| 0.02 | -0.13 |
| 0.02 | -0.13 |
| 0.02 | -0.13 |
| 0.02 | -0.13 |
| 0.02 | -0.13 |
| 0.02 | -0.13 |
| 0.02 | -0.13 |
| 0.02 | -0.13 |
| 0.02 | -0.13 |
| 0.02 | -0.13 |
| 0.02 | -0.13 |
| 0.02 | -0.13 |
| 0.02 | -0.13 |
| 0.02 | -0.13 |
| 0.02 | -0.13 |
| 0.02 | -0.13 |
| 0.02 | -0.13 |
| 0.02 | -0.13 |
| 0.02 | -0.13 |
| 0.02 | -0.13 |
| 0.02 | -0.13 |
| 0.02 | -0.13 |
| 0.02 | -0.13 |
| 0.02 | -0.13 |
| 0.02 | -0.13 |
| 0.02 | -0.13 |
| 0.02 | -0.13 |
| 0.02 | -0.13 |
| 0.02 | -0.13 |
| 0.02 | -0.13 |
| 0.02 | -0.13 |
| 0.02 | -0.13 |
| 0.02 | -0.13 |
| 0.02 | -0.13 |
| 0.02 | -0.13 |
| 0.02 | -0.13 |
| 0.02 | -0.13 |
| 0.02 | -0.13 |
| 0.02 | -0.13 |
| 0.02 | -0.13 |
| 0.02 | -0.13 |
| 0.02 | -0.13 |
| 0.02 | -0.13 |
| 0.02 | -0.13 |
| 0.02 | -0.13 |
| 0.02 | -0.13 |
| 0.02 | -0.13 |
| 0.02 | -0.13 |
| 0.02 | -0.13 |
| 0.02 | -0.13 |
| 0.02 | -0.13 |
| 0.02 | -0.13 |
| 0.02 | -0.13 |
| 0.02 | -0.13 |
| 0.02 | -0.13 |
| 0.02 | -0.13 |
| 0.02 | -0.13 |
| 0.02 | -0.13 |
| 0.02 | -0.13 |
| 0.02 | -0.13 |
| 0.02 | -0.13 |
| 0.02 | -0.13 |
| 0.02 | -0.13 |
| 0.02 | -0.13 |
| 0.02 | -0.13 |
| 0.02 | -0.13 |
| 0.02 | -0.13 |
| 0.02 | -0.13 |
| 0.02 | -0.13 |
| 0.02 | -0.13 |
| 0.02 | -0.13 |
| 0.02 | -0.13 |
| 0.02 | -0.13 |
| 0.02 | -0.13 |
| 0.02 | -0.13 |
| 0.02 | -0.13 |
| 0.02 | -0.13 |
| 0.02 | -0.13 |
| 0.02 | -0.13 |
| 0.02 | -0.13 |
| 0.02 | -0.13 |
| 0.02 | -0.13 |
| 0.02 | -0.13 |
| 0.02 | -0.13 |
| 0.02 | -0.13 |
| 0.02 | -0.13 |
| 0.02 | -0.13 |
| 0.02 | -0.13 |
| 0.02 | -0.13 |
| 0.02 | -0.13 |
| 0.02 | -0.13 |
| 0.02 | -0.13 |
| 0.02 | -0.13 |
| 0.02 | -0.13 |
| 0.02 | -0.13 |
| 0.02 | -0.13 |
| 0.02 | -0.13 |
| 0.02 | -0.13 |
| 0.02 | -0.13 |
| 0.02 | -0.13 |
| 0.02 | -0.13 |
| 0.02 | -0.13 |
| 0.02 | -0.13 |
| 0.02 | -0.13 |
| 0.01 | -0.13 |
| 0.01 | -0.13 |
| 0.01 | -0.13 |
| 0.01 | -0.13 |
| 0.01 | -0.13 |
| 0.01 | -0.13 |
| 0.01 | -0.13 |
| 0.01 | -0.13 |
| 0.01 | -0.13 |
| 0.01 | -0.13 |
| 0.01 | -0.13 |
| 0.01 | -0.13 |
| 0.02 | -0.13 |
| 0.02 | -0.13 |
| 0.02 | -0.13 |
| 0.02 | -0.13 |
| 0.02 | -0.13 |
| 0.02 | -0.13 |
| 0.02 | -0.13 |
| 0.02 | -0.13 |
| 0.02 | -0.13 |
| 0.02 | -0.13 |
| 0.02 | -0.13 |
| 0.02 | -0.13 |
| 0.02 | -0.13 |
| 0.02 | -0.13 |
| 0.02 | -0.13 |
| 0.02 | -0.13 |
| 0.02 | -0.13 |
| 0.02 | -0.13 |
| 0.02 | -0.13 |
| 0.02 | -0.13 |
| 0.02 | -0.13 |
| 0.02 | -0.13 |
| 0.02 | -0.13 |
| 0.02 | -0.13 |
| 0.02 | -0.13 |
| 0.02 | -0.13 |
| 0.02 | -0.13 |
| 0.02 | -0.13 |
| 0.02 | -0.13 |
| 0.02 | -0.13 |
| 0.02 | -0.13 |
| 0.02 | -0.13 |
| 0.02 | -0.13 |
| 0.02 | -0.13 |
| 0.02 | -0.13 |
| 0.02 | -0.13 |
| 0.02 | -0.13 |
| 0.02 | -0.13 |
| 0.02 | -0.13 |
| 0.02 | -0.13 |
| 0.02 | -0.13 |
| 0.02 | -0.13 |
| 0.02 | -0.13 |
| 0.02 | -0.13 |
| 0.02 | -0.13 |
| 0.02 | -0.13 |
| 0.02 | -0.13 |
| 0.02 | -0.13 |
| 0.02 | -0.13 |
| 0.02 | -0.13 |
| 0.02 | -0.13 |
| 0.02 | -0.13 |
| 0.02 | -0.13 |
| 0.02 | -0.13 |
| 0.02 | -0.13 |
| 0.02 | -0.13 |
| 0.02 | -0.13 |
| 0.02 | -0.13 |
| 0.02 | -0.13 |
| 0.02 | -0.13 |
| 0.02 | -0.13 |
| 0.02 | -0.13 |
| 0.02 | -0.13 |
| 0.02 | -0.13 |
| 0.02 | -0.13 |
| 0.02 | -0.13 |
| 0.02 | -0.13 |
| 0.02 | -0.13 |
| 0.02 | -0.13 |
| 0.02 | -0.13 |
| 0.02 | -0.13 |
| 0.02 | -0.13 |
| 0.02 | -0.13 |
| 0.02 | -0.13 |
| 0.02 | -0.13 |
| 0.02 | -0.13 |
| 0.02 | -0.13 |
| 0.02 | -0.13 |
| 0.02 | -0.13 |
| 0.02 | -0.13 |
| 0.02 | -0.13 |
| 0.02 | -0.13 |
| 0.02 | -0.13 |
| 0.02 | -0.13 |
| 0.02 | -0.13 |
| 0.02 | -0.13 |
| 0.02 | -0.13 |
| 0.02 | -0.13 |
| 0.02 | -0.13 |
| 0.02 | -0.13 |
| 0.02 | -0.13 |
| 0.02 | -0.13 |
| 0.02 | -0.13 |
| 0.02 | -0.13 |
| 0.02 | -0.13 |
| 0.02 | -0.13 |
| 0.02 | -0.13 |
| 0.02 | -0.13 |
| 0.02 | -0.13 |
| 0.02 | -0.13 |
| 0.02 | -0.13 |
| 0.02 | -0.13 |
| 0.02 | -0.13 |
| 0.02 | -0.13 |
| 0.02 | -0.13 |
| 0.02 | -0.13 |
| 0.02 | -0.13 |
| 0.02 | -0.13 |
| 0.02 | -0.13 |
| 0.02 | -0.13 |
| 0.02 | -0.13 |
| 0.02 | -0.13 |
| 0.02 | -0.13 |
| 0.02 | -0.13 |
| 0.01 | -0.13 |
| 0.01 | -0.13 |
| 0.01 | -0.13 |
| 0.01 | -0.13 |
| 0.01 | -0.13 |
| 0.01 | -0.13 |
| 0.02 | -0.13 |
| 0.02 | -0.13 |
| 0.02 | -0.13 |
| 0.02 | -0.13 |
| 0.02 | -0.13 |
| 0.02 | -0.13 |
| 0.02 | -0.13 |
| 0.02 | -0.13 |
| 0.02 | -0.13 |
| 0.02 | -0.13 |
| 0.02 | -0.13 |
| 0.02 | -0.13 |
| 0.01 | -0.13 |
| 0.01 | -0.13 |
| 0.01 | -0.13 |
| 0.01 | -0.13 |
| 0.01 | -0.13 |
| 0.01 | -0.13 |
| 0.02 | -0.13 |
| 0.02 | -0.13 |
| 0.02 | -0.13 |
| 0.02 | -0.13 |
| 0.02 | -0.13 |
| 0.02 | -0.13 |
| 0.02 | -0.13 |
| 0.02 | -0.13 |
| 0.02 | -0.13 |
| 0.02 | -0.13 |
| 0.02 | -0.13 |
| 0.02 | -0.13 |
| 0.02 | -0.13 |
| 0.02 | -0.13 |
| 0.02 | -0.13 |
| 0.02 | -0.13 |
| 0.02 | -0.13 |
| 0.02 | -0.13 |
| 0.02 | -0.13 |
| 0.02 | -0.13 |
| 0.02 | -0.13 |
| 0.02 | -0.13 |
| 0.02 | -0.13 |
| 0.02 | -0.13 |
| 0.02 | -0.13 |
| 0.02 | -0.13 |
| 0.02 | -0.13 |
| 0.02 | -0.13 |
| 0.02 | -0.13 |
| 0.02 | -0.13 |
| 0.02 | -0.13 |
| 0.02 | -0.13 |
| 0.02 | -0.13 |
| 0.02 | -0.13 |
| 0.02 | -0.13 |
| 0.02 | -0.13 |
| 0.02 | -0.13 |
| 0.02 | -0.13 |
| 0.02 | -0.13 |
| 0.02 | -0.13 |
| 0.02 | -0.13 |
| 0.02 | -0.13 |
| 0.01 | -0.13 |
| 0.01 | -0.13 |
| 0.01 | -0.13 |
| 0.01 | -0.13 |
| 0.01 | -0.13 |
| 0.01 | -0.13 |
| 0.02 | -0.13 |
| 0.02 | -0.13 |
| 0.02 | -0.13 |
| 0.02 | -0.13 |
| 0.02 | -0.13 |
| 0.02 | -0.13 |
| 0.02 | -0.13 |
| 0.02 | -0.13 |
| 0.02 | -0.13 |
| 0.02 | -0.13 |
| 0.02 | -0.13 |
| 0.02 | -0.13 |
| 0.02 | -0.13 |
| 0.02 | -0.13 |
| 0.02 | -0.13 |
| 0.02 | -0.13 |
| 0.02 | -0.13 |
| 0.02 | -0.13 |
| 0.01 | -0.13 |
| 0.01 | -0.13 |
| 0.01 | -0.13 |
| 0.01 | -0.13 |
| 0.01 | -0.13 |
| 0.01 | -0.13 |
| 0.02 | -0.13 |
| 0.02 | -0.13 |
| 0.02 | -0.13 |
| 0.02 | -0.13 |
| 0.02 | -0.13 |
| 0.02 | -0.13 |
| 0.02 | -0.13 |
| 0.02 | -0.13 |
| 0.02 | -0.13 |
| 0.02 | -0.13 |
| 0.02 | -0.13 |
| 0.02 | -0.13 |
| 0.02 | -0.13 |
| 0.02 | -0.13 |
| 0.02 | -0.13 |
| 0.02 | -0.13 |
| 0.02 | -0.13 |
| 0.02 | -0.13 |
| 0.02 | -0.13 |
| 0.02 | -0.13 |
| 0.02 | -0.13 |
| 0.02 | -0.13 |
| 0.02 | -0.13 |
| 0.02 | -0.13 |
| 0.02 | -0.13 |
| 0.02 | -0.13 |
| 0.02 | -0.13 |
| 0.02 | -0.13 |
| 0.02 | -0.13 |
| 0.02 | -0.13 |
| 0.02 | -0.13 |
| 0.02 | -0.13 |
| 0.02 | -0.13 |
| 0.02 | -0.13 |
| 0.02 | -0.13 |
| 0.02 | -0.13 |
| 0.02 | -0.13 |
| 0.02 | -0.13 |
| 0.02 | -0.13 |
| 0.02 | -0.13 |
| 0.02 | -0.13 |
| 0.02 | -0.13 |
| 0.02 | -0.13 |
| 0.02 | -0.13 |
| 0.02 | -0.13 |
| 0.02 | -0.13 |
| 0.02 | -0.13 |
| 0.02 | -0.13 |
| 0.02 | -0.13 |
| 0.02 | -0.13 |
| 0.02 | -0.13 |
| 0.02 | -0.13 |
| 0.02 | -0.13 |
| 0.02 | -0.13 |
| 0.02 | -0.13 |
| 0.02 | -0.13 |
| 0.02 | -0.13 |
| 0.02 | -0.13 |
| 0.02 | -0.13 |
| 0.02 | -0.13 |
| 0.02 | -0.13 |
| 0.02 | -0.13 |
| 0.02 | -0.13 |
| 0.02 | -0.13 |
| 0.02 | -0.13 |
| 0.02 | -0.13 |
| 0.02 | -0.13 |
| 0.02 | -0.13 |
| 0.02 | -0.13 |
| 0.02 | -0.13 |
| 0.02 | -0.13 |
| 0.02 | -0.13 |
| 0.02 | -0.13 |
| 0.02 | -0.13 |
| 0.02 | -0.13 |
| 0.02 | -0.13 |
| 0.02 | -0.13 |
| 0.02 | -0.13 |
| 0.01 | -0.13 |
| 0.01 | -0.13 |
| 0.01 | -0.13 |
| 0.01 | -0.13 |
| 0.01 | -0.13 |
| 0.01 | -0.13 |
| 0.02 | -0.13 |
| 0.02 | -0.13 |
| 0.02 | -0.13 |
| 0.02 | -0.13 |
| 0.02 | -0.13 |
| 0.02 | -0.13 |
| 0.02 | -0.13 |
| 0.02 | -0.13 |
| 0.02 | -0.13 |
| 0.02 | -0.13 |
| 0.02 | -0.13 |
| 0.02 | -0.13 |
| 0.02 | -0.13 |
| 0.02 | -0.13 |
| 0.02 | -0.13 |
| 0.02 | -0.13 |
| 0.02 | -0.13 |
| 0.02 | -0.13 |
| 0.02 | -0.13 |
| 0.02 | -0.13 |
| 0.02 | -0.13 |
| 0.02 | -0.13 |
| 0.02 | -0.13 |
| 0.02 | -0.13 |
| 0.02 | -0.13 |
| 0.02 | -0.13 |
| 0.02 | -0.13 |
| 0.02 | -0.13 |
| 0.02 | -0.13 |
| 0.02 | -0.13 |
| 0.02 | -0.13 |
| 0.02 | -0.13 |
| 0.02 | -0.13 |
| 0.02 | -0.13 |
| 0.02 | -0.13 |
| 0.02 | -0.13 |
| 0.01 | -0.13 |
| 0.01 | -0.13 |
| 0.01 | -0.13 |
| 0.01 | -0.13 |
| 0.01 | -0.13 |
| 0.01 | -0.13 |
| 0.02 | -0.13 |
| 0.02 | -0.13 |
| 0.02 | -0.13 |
| 0.02 | -0.13 |
| 0.02 | -0.13 |
| 0.02 | -0.13 |
| 0.01 | -0.13 |
| 0.01 | -0.13 |
| 0.01 | -0.13 |
| 0.01 | -0.13 |
| 0.01 | -0.13 |
| 0.01 | -0.13 |
| 0.01 | -0.13 |
| 0.01 | -0.13 |
| 0.01 | -0.13 |
| 0.01 | -0.13 |
| 0.01 | -0.13 |
| 0.01 | -0.13 |
| 0.02 | -0.13 |
| 0.02 | -0.13 |
| 0.02 | -0.13 |
| 0.02 | -0.13 |
| 0.02 | -0.13 |
| 0.02 | -0.13 |
| 0.02 | -0.13 |
| 0.02 | -0.13 |
| 0.02 | -0.13 |
| 0.02 | -0.13 |
| 0.02 | -0.13 |
| 0.02 | -0.13 |
| 0.02 | -0.13 |
| 0.02 | -0.13 |
| 0.02 | -0.13 |
| 0.02 | -0.13 |
| 0.02 | -0.13 |
| 0.02 | -0.13 |
| 0.02 | -0.13 |
| 0.02 | -0.13 |
| 0.02 | -0.13 |
| 0.02 | -0.13 |
| 0.02 | -0.13 |
| 0.02 | -0.13 |
| 0.02 | -0.13 |
| 0.02 | -0.13 |
| 0.02 | -0.13 |
| 0.02 | -0.13 |
| 0.02 | -0.13 |
| 0.02 | -0.13 |
| 0.02 | -0.13 |
| 0.02 | -0.13 |
| 0.02 | -0.13 |
| 0.02 | -0.13 |
| 0.02 | -0.13 |
| 0.02 | -0.13 |
| 0.02 | -0.13 |
| 0.02 | -0.13 |
| 0.02 | -0.13 |
| 0.02 | -0.13 |
| 0.02 | -0.13 |
| 0.02 | -0.13 |
| 0.02 | -0.13 |
| 0.02 | -0.13 |
| 0.02 | -0.13 |
| 0.02 | -0.13 |
| 0.02 | -0.13 |
| 0.02 | -0.13 |
| 0.02 | -0.13 |
| 0.02 | -0.13 |
| 0.02 | -0.13 |
| 0.02 | -0.13 |
| 0.02 | -0.13 |
| 0.02 | -0.13 |
| 0.01 | -0.13 |
| 0.01 | -0.13 |
| 0.01 | -0.13 |
| 0.01 | -0.13 |
| 0.01 | -0.13 |
| 0.01 | -0.13 |
| 0.01 | -0.13 |
| 0.01 | -0.13 |
| 0.01 | -0.13 |
| 0.01 | -0.13 |
| 0.01 | -0.13 |
| 0.01 | -0.13 |
| 0.02 | -0.13 |
| 0.02 | -0.13 |
| 0.02 | -0.13 |
| 0.02 | -0.13 |
| 0.02 | -0.13 |
| 0.02 | -0.13 |
| 0.02 | -0.13 |
| 0.02 | -0.13 |
| 0.02 | -0.13 |
| 0.02 | -0.13 |
| 0.02 | -0.13 |
| 0.02 | -0.13 |
| 0.01 | -0.13 |
| 0.01 | -0.13 |
| 0.01 | -0.13 |
| 0.01 | -0.13 |
| 0.01 | -0.13 |
| 0.01 | -0.13 |
| 0.01 | -0.13 |
| 0.01 | -0.13 |
| 0.01 | -0.13 |
| 0.01 | -0.13 |
| 0.01 | -0.13 |
| 0.01 | -0.13 |
| 0.02 | -0.13 |
| 0.02 | -0.13 |
| 0.02 | -0.13 |
| 0.02 | -0.13 |
| 0.02 | -0.13 |
| 0.02 | -0.13 |
| 0.02 | -0.13 |
| 0.02 | -0.13 |
| 0.02 | -0.13 |
| 0.02 | -0.13 |
| 0.02 | -0.13 |
| 0.02 | -0.13 |
| 0.02 | -0.13 |
| 0.02 | -0.13 |
| 0.02 | -0.13 |
| 0.02 | -0.13 |
| 0.02 | -0.13 |
| 0.02 | -0.13 |
| 0.02 | -0.13 |
| 0.02 | -0.13 |
| 0.02 | -0.13 |
| 0.02 | -0.13 |
| 0.02 | -0.13 |
| 0.02 | -0.13 |
| 0.01 | -0.13 |
| 0.01 | -0.13 |
| 0.01 | -0.13 |
| 0.01 | -0.13 |
| 0.01 | -0.13 |
| 0.01 | -0.13 |
| 0.02 | -0.13 |
| 0.02 | -0.13 |
| 0.02 | -0.13 |
| 0.02 | -0.13 |
| 0.02 | -0.13 |
| 0.02 | -0.13 |
| 0.02 | -0.13 |
| 0.02 | -0.13 |
| 0.02 | -0.13 |
| 0.02 | -0.13 |
| 0.02 | -0.13 |
| 0.02 | -0.13 |
| 0.02 | -0.13 |
| 0.02 | -0.13 |
| 0.02 | -0.13 |
| 0.02 | -0.13 |
| 0.02 | -0.13 |
| 0.02 | -0.13 |
| 0.02 | -0.13 |
| 0.02 | -0.13 |
| 0.02 | -0.13 |
| 0.02 | -0.13 |
| 0.02 | -0.13 |
| 0.02 | -0.13 |
| 0.02 | -0.13 |
| 0.02 | -0.13 |
| 0.02 | -0.13 |
| 0.02 | -0.13 |
| 0.02 | -0.13 |
| 0.02 | -0.13 |
| 0.02 | -0.13 |
| 0.02 | -0.13 |
| 0.02 | -0.13 |
| 0.02 | -0.13 |
| 0.02 | -0.13 |
| 0.02 | -0.13 |
| 0.02 | -0.13 |
| 0.02 | -0.13 |
| 0.02 | -0.13 |
| 0.02 | -0.13 |
| 0.02 | -0.13 |
| 0.02 | -0.13 |
| 0.01 | -0.13 |
| 0.01 | -0.13 |
| 0.01 | -0.13 |
| 0.01 | -0.13 |
| 0.01 | -0.13 |
| 0.01 | -0.13 |
| 0.01 | -0.13 |
| 0.01 | -0.13 |
| 0.01 | -0.13 |
| 0.01 | -0.13 |
| 0.01 | -0.13 |
| 0.01 | -0.13 |
| 0.01 | -0.13 |
| 0.01 | -0.13 |
| 0.01 | -0.13 |
| 0.01 | -0.13 |
| 0.01 | -0.13 |
| 0.01 | -0.13 |
| 0.02 | -0.13 |
| 0.02 | -0.13 |
| 0.02 | -0.13 |
| 0.02 | -0.13 |
| 0.02 | -0.13 |
| 0.02 | -0.13 |
| 0.02 | -0.13 |
| 0.02 | -0.13 |
| 0.02 | -0.13 |
| 0.02 | -0.13 |
| 0.02 | -0.13 |
| 0.02 | -0.13 |
| 0.02 | -0.13 |
| 0.02 | -0.13 |
| 0.02 | -0.13 |
| 0.02 | -0.13 |
| 0.02 | -0.13 |
| 0.02 | -0.13 |
| 0.02 | -0.13 |
| 0.02 | -0.13 |
| 0.02 | -0.13 |
| 0.02 | -0.13 |
| 0.02 | -0.13 |
| 0.02 | -0.13 |
| 0.02 | -0.13 |
| 0.02 | -0.13 |
| 0.02 | -0.13 |
| 0.02 | -0.13 |
| 0.02 | -0.13 |
| 0.02 | -0.13 |
| 0.02 | -0.13 |
| 0.02 | -0.13 |
| 0.02 | -0.13 |
| 0.02 | -0.13 |
| 0.02 | -0.13 |
| 0.02 | -0.13 |
| 0.02 | -0.13 |
| 0.02 | -0.13 |
| 0.02 | -0.13 |
| 0.02 | -0.13 |
| 0.02 | -0.13 |
| 0.02 | -0.13 |
| 0.02 | -0.13 |
| 0.02 | -0.13 |
| 0.02 | -0.13 |
| 0.02 | -0.13 |
| 0.02 | -0.13 |
| 0.02 | -0.13 |
| 0.02 | -0.13 |
| 0.02 | -0.13 |
| 0.02 | -0.13 |
| 0.02 | -0.13 |
| 0.02 | -0.13 |
| 0.02 | -0.13 |
| 0.02 | -0.13 |
| 0.02 | -0.13 |
| 0.02 | -0.13 |
| 0.02 | -0.13 |
| 0.02 | -0.13 |
| 0.02 | -0.13 |
| 0.02 | -0.13 |
| 0.02 | -0.13 |
| 0.02 | -0.13 |
| 0.02 | -0.13 |
| 0.02 | -0.13 |
| 0.02 | -0.13 |
| 0.02 | -0.13 |
| 0.02 | -0.13 |
| 0.02 | -0.13 |
| 0.02 | -0.13 |
| 0.02 | -0.13 |
| 0.02 | -0.13 |
| 0.02 | -0.13 |
| 0.02 | -0.13 |
| 0.02 | -0.13 |
| 0.02 | -0.13 |
| 0.02 | -0.13 |
| 0.02 | -0.13 |
| 0.02 | -0.13 |
| 0.02 | -0.13 |
| 0.02 | -0.13 |
| 0.02 | -0.13 |
| 0.02 | -0.13 |
| 0.02 | -0.13 |
| 0.02 | -0.13 |
| 0.02 | -0.13 |
| 0.02 | -0.13 |
| 0.02 | -0.13 |
| 0.02 | -0.13 |
| 0.02 | -0.13 |
| 0.02 | -0.13 |
| 0.02 | -0.13 |
| 0.02 | -0.13 |
| 0.02 | -0.13 |
| 0.02 | -0.13 |
| 0.02 | -0.13 |
| 0.02 | -0.13 |
| 0.02 | -0.13 |
| 0.02 | -0.13 |
| 0.02 | -0.13 |
| 0.02 | -0.13 |
| 0.02 | -0.13 |
| 0.02 | -0.13 |
| 0.02 | -0.13 |
| 0.02 | -0.13 |
| 0.02 | -0.13 |
| 0.02 | -0.13 |
| 0.02 | -0.13 |
| 0.02 | -0.13 |
| 0.02 | -0.13 |
| 0.02 | -0.13 |
| 0.02 | -0.13 |
| 0.02 | -0.13 |
| 0.02 | -0.13 |
| 0.01 | -0.13 |
| 0.01 | -0.13 |
| 0.01 | -0.13 |
| 0.01 | -0.13 |
| 0.01 | -0.13 |
| 0.01 | -0.13 |
| 0.02 | -0.13 |
| 0.02 | -0.13 |
| 0.02 | -0.13 |
| 0.02 | -0.13 |
| 0.02 | -0.13 |
| 0.02 | -0.13 |
| 0.02 | -0.13 |
| 0.02 | -0.13 |
| 0.02 | -0.13 |
| 0.02 | -0.13 |
| 0.02 | -0.13 |
| 0.02 | -0.13 |
| 0.02 | -0.13 |
| 0.02 | -0.13 |
| 0.02 | -0.13 |
| 0.02 | -0.13 |
| 0.02 | -0.13 |
| 0.02 | -0.13 |
| 0.02 | -0.13 |
| 0.02 | -0.13 |
| 0.02 | -0.13 |
| 0.02 | -0.13 |
| 0.02 | -0.13 |
| 0.02 | -0.13 |
| 0.02 | -0.13 |
| 0.02 | -0.13 |
| 0.02 | -0.13 |
| 0.02 | -0.13 |
| 0.02 | -0.13 |
| 0.02 | -0.13 |
| 0.02 | -0.13 |
| 0.02 | -0.13 |
| 0.02 | -0.13 |
| 0.02 | -0.13 |
| 0.02 | -0.13 |
| 0.02 | -0.13 |
| 0.01 | -0.13 |
| 0.01 | -0.13 |
| 0.01 | -0.13 |
| 0.01 | -0.13 |
| 0.01 | -0.13 |
| 0.01 | -0.13 |
| 0.01 | -0.13 |
| 0.01 | -0.13 |
| 0.01 | -0.13 |
| 0.01 | -0.13 |
| 0.01 | -0.13 |
| 0.01 | -0.13 |
| 0.01 | -0.13 |
| 0.01 | -0.13 |
| 0.01 | -0.13 |
| 0.01 | -0.13 |
| 0.01 | -0.13 |
| 0.01 | -0.13 |
| 0.01 | -0.13 |
| 0.01 | -0.13 |
| 0.01 | -0.13 |
| 0.01 | -0.13 |
| 0.01 | -0.13 |
| 0.01 | -0.13 |
| 0.01 | -0.13 |
| 0.01 | -0.13 |
| 0.01 | -0.13 |
| 0.01 | -0.13 |
| 0.01 | -0.13 |
| 0.01 | -0.13 |
| 0.02 | -0.13 |
| 0.02 | -0.13 |
| 0.02 | -0.13 |
| 0.02 | -0.13 |
| 0.02 | -0.13 |
| 0.02 | -0.13 |
| 0.02 | -0.13 |
| 0.02 | -0.13 |
| 0.02 | -0.13 |
| 0.02 | -0.13 |
| 0.02 | -0.13 |
| 0.02 | -0.13 |
| 0.02 | -0.13 |
| 0.02 | -0.13 |
| 0.02 | -0.13 |
| 0.02 | -0.13 |
| 0.02 | -0.13 |
| 0.02 | -0.13 |
| 0.02 | -0.13 |
| 0.02 | -0.13 |
| 0.02 | -0.13 |
| 0.02 | -0.13 |
| 0.02 | -0.13 |
| 0.02 | -0.13 |
| 0.01 | -0.13 |
| 0.01 | -0.13 |
| 0.01 | -0.13 |
| 0.01 | -0.13 |
| 0.01 | -0.13 |
| 0.01 | -0.13 |
| 0.01 | -0.13 |
| 0.01 | -0.13 |
| 0.01 | -0.13 |
| 0.01 | -0.13 |
| 0.01 | -0.13 |
| 0.01 | -0.13 |
| 0.02 | -0.13 |
| 0.02 | -0.13 |
| 0.02 | -0.13 |
| 0.02 | -0.13 |
| 0.02 | -0.13 |
| 0.02 | -0.13 |
| 0.02 | -0.13 |
| 0.02 | -0.13 |
| 0.02 | -0.13 |
| 0.02 | -0.13 |
| 0.02 | -0.13 |
| 0.02 | -0.13 |
| 0.02 | -0.13 |
| 0.02 | -0.13 |
| 0.02 | -0.13 |
| 0.02 | -0.13 |
| 0.02 | -0.13 |
| 0.02 | -0.13 |
| 0.02 | -0.13 |
| 0.02 | -0.13 |
| 0.02 | -0.13 |
| 0.02 | -0.13 |
| 0.02 | -0.13 |
| 0.02 | -0.13 |
| 0.02 | -0.13 |
| 0.02 | -0.13 |
| 0.02 | -0.13 |
| 0.02 | -0.13 |
| 0.02 | -0.13 |
| 0.02 | -0.13 |
| 0.01 | -0.13 |
| 0.01 | -0.13 |
| 0.01 | -0.13 |
| 0.01 | -0.13 |
| 0.01 | -0.13 |
| 0.01 | -0.13 |
| 0.01 | -0.13 |
| 0.01 | -0.13 |
| 0.01 | -0.13 |
| 0.01 | -0.13 |
| 0.01 | -0.13 |
| 0.01 | -0.13 |
| 0.02 | -0.13 |
| 0.02 | -0.13 |
| 0.02 | -0.13 |
| 0.02 | -0.13 |
| 0.02 | -0.13 |
| 0.02 | -0.13 |
| 0.02 | -0.13 |
| 0.02 | -0.13 |
| 0.02 | -0.13 |
| 0.02 | -0.13 |
| 0.02 | -0.13 |
| 0.02 | -0.13 |
| 0.02 | -0.13 |
| 0.02 | -0.13 |
| 0.02 | -0.13 |
| 0.02 | -0.13 |
| 0.02 | -0.13 |
| 0.02 | -0.13 |
| 0.02 | -0.13 |
| 0.02 | -0.13 |
| 0.02 | -0.13 |
| 0.02 | -0.13 |
| 0.02 | -0.13 |
| 0.02 | -0.13 |
| 0.02 | -0.13 |
| 0.02 | -0.13 |
| 0.02 | -0.13 |
| 0.02 | -0.13 |
| 0.02 | -0.13 |
| 0.02 | -0.13 |
| 0.02 | -0.13 |
| 0.02 | -0.13 |
| 0.02 | -0.13 |
| 0.02 | -0.13 |
| 0.02 | -0.13 |
| 0.02 | -0.13 |
| 0.02 | -0.13 |
| 0.02 | -0.13 |
| 0.02 | -0.13 |
| 0.02 | -0.13 |
| 0.02 | -0.13 |
| 0.02 | -0.13 |
| 0.02 | -0.13 |
| 0.02 | -0.13 |
| 0.02 | -0.13 |
| 0.02 | -0.13 |
| 0.02 | -0.13 |
| 0.02 | -0.13 |
| 0.02 | -0.13 |
| 0.02 | -0.13 |
| 0.02 | -0.13 |
| 0.02 | -0.13 |
| 0.02 | -0.13 |
| 0.02 | -0.13 |
| 0.02 | -0.13 |
| 0.02 | -0.13 |
| 0.02 | -0.13 |
| 0.02 | -0.13 |
| 0.02 | -0.13 |
| 0.02 | -0.13 |
| 0.02 | -0.13 |
| 0.02 | -0.13 |
| 0.02 | -0.13 |
| 0.02 | -0.13 |
| 0.02 | -0.13 |
| 0.02 | -0.13 |
| 0.02 | -0.13 |
| 0.02 | -0.13 |
| 0.02 | -0.13 |
| 0.02 | -0.13 |
| 0.02 | -0.13 |
| 0.02 | -0.13 |
| 0.02 | -0.13 |
| 0.02 | -0.13 |
| 0.02 | -0.13 |
| 0.02 | -0.13 |
| 0.02 | -0.13 |
| 0.02 | -0.13 |
| 0.02 | -0.13 |
| 0.02 | -0.13 |
| 0.02 | -0.13 |
| 0.02 | -0.13 |
| 0.02 | -0.13 |
| 0.02 | -0.13 |
| 0.02 | -0.13 |
| 0.02 | -0.13 |
| 0.02 | -0.13 |
| 0.02 | -0.13 |
| 0.02 | -0.13 |
| 0.02 | -0.13 |
| 0.01 | -0.13 |
| 0.01 | -0.13 |
| 0.01 | -0.13 |
| 0.01 | -0.13 |
| 0.01 | -0.13 |
| 0.01 | -0.13 |
| 0.02 | -0.13 |
| 0.02 | -0.13 |
| 0.02 | -0.13 |
| 0.02 | -0.13 |
| 0.02 | -0.13 |
| 0.02 | -0.13 |
| 0.01 | -0.13 |
| 0.01 | -0.13 |
| 0.01 | -0.13 |
| 0.01 | -0.13 |
| 0.01 | -0.13 |
| 0.01 | -0.13 |
| 0.01 | -0.13 |
| 0.01 | -0.13 |
| 0.01 | -0.13 |
| 0.01 | -0.13 |
| 0.01 | -0.13 |
| 0.01 | -0.13 |
| 0.02 | -0.13 |
| 0.02 | -0.13 |
| 0.02 | -0.13 |
| 0.02 | -0.13 |
| 0.02 | -0.13 |
| 0.02 | -0.13 |
| 0.02 | -0.13 |
| 0.02 | -0.13 |
| 0.02 | -0.13 |
| 0.02 | -0.13 |
| 0.02 | -0.13 |
| 0.02 | -0.13 |
| 0.01 | -0.13 |
| 0.01 | -0.13 |
| 0.01 | -0.13 |
| 0.01 | -0.13 |
| 0.01 | -0.13 |
| 0.01 | -0.13 |
| 0.01 | -0.13 |
| 0.01 | -0.13 |
| 0.01 | -0.13 |
| 0.01 | -0.13 |
| 0.01 | -0.13 |
| 0.01 | -0.13 |
| 0.01 | -0.13 |
| 0.01 | -0.13 |
| 0.01 | -0.13 |
| 0.01 | -0.13 |
| 0.01 | -0.13 |
| 0.01 | -0.13 |
| 0.02 | -0.13 |
| 0.02 | -0.13 |
| 0.02 | -0.13 |
| 0.02 | -0.13 |
| 0.02 | -0.13 |
| 0.02 | -0.13 |
| 0.02 | -0.13 |
| 0.02 | -0.13 |
| 0.02 | -0.13 |
| 0.02 | -0.13 |
| 0.02 | -0.13 |
| 0.02 | -0.13 |
| 0.01 | -0.13 |
| 0.01 | -0.13 |
| 0.01 | -0.13 |
| 0.01 | -0.13 |
| 0.01 | -0.13 |
| 0.01 | -0.13 |
| 0.02 | -0.13 |
| 0.02 | -0.13 |
| 0.02 | -0.13 |
| 0.02 | -0.13 |
| 0.02 | -0.13 |
| 0.02 | -0.13 |
| 0.02 | -0.13 |
| 0.02 | -0.13 |
| 0.02 | -0.13 |
| 0.02 | -0.13 |
| 0.02 | -0.13 |
| 0.02 | -0.13 |
| 0.02 | -0.13 |
| 0.02 | -0.13 |
| 0.02 | -0.13 |
| 0.02 | -0.13 |
| 0.02 | -0.13 |
| 0.02 | -0.13 |
| 0.02 | -0.13 |
| 0.02 | -0.13 |
| 0.02 | -0.13 |
| 0.02 | -0.13 |
| 0.02 | -0.13 |
| 0.02 | -0.13 |
| 0.02 | -0.13 |
| 0.02 | -0.13 |
| 0.02 | -0.13 |
| 0.02 | -0.13 |
| 0.02 | -0.13 |
| 0.02 | -0.13 |
| 0.02 | -0.13 |
| 0.02 | -0.13 |
| 0.02 | -0.13 |
| 0.02 | -0.13 |
| 0.02 | -0.13 |
| 0.02 | -0.13 |
| 0.02 | -0.13 |
| 0.02 | -0.13 |
| 0.02 | -0.13 |
| 0.02 | -0.13 |
| 0.02 | -0.13 |
| 0.02 | -0.13 |
| 0.02 | -0.13 |
| 0.02 | -0.13 |
| 0.02 | -0.13 |
| 0.02 | -0.13 |
| 0.02 | -0.13 |
| 0.02 | -0.13 |
| 0.02 | -0.13 |
| 0.02 | -0.13 |
| 0.02 | -0.13 |
| 0.02 | -0.13 |
| 0.02 | -0.13 |
| 0.02 | -0.13 |
| 0.02 | -0.13 |
| 0.02 | -0.13 |
| 0.02 | -0.13 |
| 0.02 | -0.13 |
| 0.02 | -0.13 |
| 0.02 | -0.13 |
| 0.02 | -0.13 |
| 0.02 | -0.13 |
| 0.02 | -0.13 |